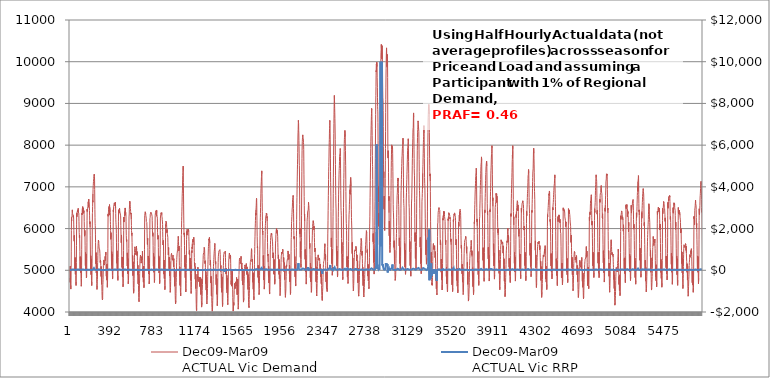
| Category | Dec09-Mar09 
ACTUAL Vic Demand |
|---|---|
| 0 | 4814.35 |
| 1 | 4710.32 |
| 2 | 5098.12 |
| 3 | 4940.95 |
| 4 | 4762.79 |
| 5 | 4645.21 |
| 6 | 4589.7 |
| 7 | 4549.49 |
| 8 | 4639.4 |
| 9 | 4763.9 |
| 10 | 5061.87 |
| 11 | 5441.15 |
| 12 | 5955.85 |
| 13 | 6263.2 |
| 14 | 6181.63 |
| 15 | 6211.84 |
| 16 | 6288.14 |
| 17 | 6304.76 |
| 18 | 6316.41 |
| 19 | 6357.25 |
| 20 | 6377.54 |
| 21 | 6448.24 |
| 22 | 6392.62 |
| 23 | 6365.6 |
| 24 | 6381.2 |
| 25 | 6384.16 |
| 26 | 6363.31 |
| 27 | 6349.62 |
| 28 | 6314.06 |
| 29 | 6272.93 |
| 30 | 6309.29 |
| 31 | 6285.74 |
| 32 | 6284.96 |
| 33 | 6227.77 |
| 34 | 6087.37 |
| 35 | 5954.17 |
| 36 | 5825.45 |
| 37 | 5727.82 |
| 38 | 5696.84 |
| 39 | 5834.98 |
| 40 | 5820.08 |
| 41 | 5715.86 |
| 42 | 5485.47 |
| 43 | 5251.98 |
| 44 | 5056.97 |
| 45 | 4997.56 |
| 46 | 5305.11 |
| 47 | 5207.66 |
| 48 | 5036.46 |
| 49 | 4904.88 |
| 50 | 5282.32 |
| 51 | 5096.13 |
| 52 | 4877.05 |
| 53 | 4733.01 |
| 54 | 4663.76 |
| 55 | 4635.86 |
| 56 | 4730.65 |
| 57 | 4887.14 |
| 58 | 5185.77 |
| 59 | 5589.48 |
| 60 | 6088.36 |
| 61 | 6364.4 |
| 62 | 6282.86 |
| 63 | 6272.21 |
| 64 | 6260.13 |
| 65 | 6387.47 |
| 66 | 6364.16 |
| 67 | 6392.78 |
| 68 | 6405.42 |
| 69 | 6444.52 |
| 70 | 6425.91 |
| 71 | 6400.38 |
| 72 | 6445.79 |
| 73 | 6466.79 |
| 74 | 6453.61 |
| 75 | 6484.99 |
| 76 | 6397.29 |
| 77 | 6388.47 |
| 78 | 6392.6 |
| 79 | 6378.63 |
| 80 | 6372.11 |
| 81 | 6308.11 |
| 82 | 6169.96 |
| 83 | 6034 |
| 84 | 5904.5 |
| 85 | 5848.97 |
| 86 | 5783.79 |
| 87 | 5846.23 |
| 88 | 5784.95 |
| 89 | 5629.75 |
| 90 | 5446.45 |
| 91 | 5207.61 |
| 92 | 5050.97 |
| 93 | 4984.23 |
| 94 | 5325.82 |
| 95 | 5215.83 |
| 96 | 5056.65 |
| 97 | 4941.71 |
| 98 | 5304.39 |
| 99 | 5139.94 |
| 100 | 4947.89 |
| 101 | 4793.39 |
| 102 | 4715.62 |
| 103 | 4617.69 |
| 104 | 4652.72 |
| 105 | 4797.32 |
| 106 | 5105.48 |
| 107 | 5492.14 |
| 108 | 6006.16 |
| 109 | 6370.73 |
| 110 | 6330.28 |
| 111 | 6365.26 |
| 112 | 6462.01 |
| 113 | 6479.34 |
| 114 | 6492.89 |
| 115 | 6496.65 |
| 116 | 6527.3 |
| 117 | 6359.29 |
| 118 | 6465.3 |
| 119 | 6500.31 |
| 120 | 6515.9 |
| 121 | 6523.16 |
| 122 | 6482.18 |
| 123 | 6463.06 |
| 124 | 6411.79 |
| 125 | 6380.66 |
| 126 | 6430.92 |
| 127 | 6437.86 |
| 128 | 6400.92 |
| 129 | 6342.7 |
| 130 | 6168.56 |
| 131 | 6029.29 |
| 132 | 5864.65 |
| 133 | 5817.97 |
| 134 | 5816.4 |
| 135 | 5932.37 |
| 136 | 5957.41 |
| 137 | 5832.9 |
| 138 | 5600.41 |
| 139 | 5364.73 |
| 140 | 5209.08 |
| 141 | 5110.8 |
| 142 | 5423.77 |
| 143 | 5333.66 |
| 144 | 5148.89 |
| 145 | 5027.66 |
| 146 | 5391.9 |
| 147 | 5224.96 |
| 148 | 5032.7 |
| 149 | 4903.03 |
| 150 | 4821.34 |
| 151 | 4801.47 |
| 152 | 4851.14 |
| 153 | 4959.57 |
| 154 | 5275.21 |
| 155 | 5673.02 |
| 156 | 6194.74 |
| 157 | 6468.1 |
| 158 | 6410.53 |
| 159 | 6389.02 |
| 160 | 6460.63 |
| 161 | 6451.72 |
| 162 | 6489.76 |
| 163 | 6529.12 |
| 164 | 6548.01 |
| 165 | 6568.19 |
| 166 | 6591.79 |
| 167 | 6642.13 |
| 168 | 6628.6 |
| 169 | 6641.67 |
| 170 | 6512.48 |
| 171 | 6705.2 |
| 172 | 6673.92 |
| 173 | 6640.47 |
| 174 | 6635.26 |
| 175 | 6612.96 |
| 176 | 6601.62 |
| 177 | 6536.39 |
| 178 | 6436.74 |
| 179 | 6322.17 |
| 180 | 6202.15 |
| 181 | 6109.82 |
| 182 | 6107.53 |
| 183 | 6164.76 |
| 184 | 6031.19 |
| 185 | 5827.35 |
| 186 | 5581.28 |
| 187 | 5312.82 |
| 188 | 5125.44 |
| 189 | 5021.24 |
| 190 | 5347.15 |
| 191 | 5224.52 |
| 192 | 5025.02 |
| 193 | 4894.96 |
| 194 | 5272.99 |
| 195 | 5103.4 |
| 196 | 4897.89 |
| 197 | 4749.76 |
| 198 | 4670.82 |
| 199 | 4633.57 |
| 200 | 4716.62 |
| 201 | 4880.95 |
| 202 | 5154.67 |
| 203 | 5505.61 |
| 204 | 6001.99 |
| 205 | 6355.34 |
| 206 | 6384.98 |
| 207 | 6529.24 |
| 208 | 6671.86 |
| 209 | 6632.73 |
| 210 | 6829.82 |
| 211 | 6935.03 |
| 212 | 6997.17 |
| 213 | 7034.96 |
| 214 | 7090.21 |
| 215 | 7129.36 |
| 216 | 7166.03 |
| 217 | 7197.02 |
| 218 | 7253.14 |
| 219 | 7251.51 |
| 220 | 7252.4 |
| 221 | 7231.69 |
| 222 | 7303.76 |
| 223 | 7312.39 |
| 224 | 7247.45 |
| 225 | 7162.72 |
| 226 | 6931.52 |
| 227 | 6683.84 |
| 228 | 6455.75 |
| 229 | 6264.68 |
| 230 | 6116.34 |
| 231 | 6075.03 |
| 232 | 5998.35 |
| 233 | 5848.6 |
| 234 | 5664.72 |
| 235 | 5437.03 |
| 236 | 5254.86 |
| 237 | 5155.67 |
| 238 | 5423.73 |
| 239 | 5275.12 |
| 240 | 5052.86 |
| 241 | 4933.85 |
| 242 | 5273.05 |
| 243 | 5069.58 |
| 244 | 4846.01 |
| 245 | 4681.74 |
| 246 | 4587.22 |
| 247 | 4541.55 |
| 248 | 4564.47 |
| 249 | 4634.42 |
| 250 | 4722.91 |
| 251 | 4779.51 |
| 252 | 4981.23 |
| 253 | 5182.16 |
| 254 | 5226.72 |
| 255 | 5349.91 |
| 256 | 5503.62 |
| 257 | 5594.24 |
| 258 | 5639.57 |
| 259 | 5676.49 |
| 260 | 5722.16 |
| 261 | 5714.31 |
| 262 | 5700.53 |
| 263 | 5695.12 |
| 264 | 5646.18 |
| 265 | 5609.54 |
| 266 | 5576.9 |
| 267 | 5532.32 |
| 268 | 5512.21 |
| 269 | 5532.88 |
| 270 | 5525.39 |
| 271 | 5524.94 |
| 272 | 5488.18 |
| 273 | 5466.92 |
| 274 | 5404.63 |
| 275 | 5322.04 |
| 276 | 5239.26 |
| 277 | 5187.47 |
| 278 | 5166.95 |
| 279 | 5239.06 |
| 280 | 5259.77 |
| 281 | 5208.23 |
| 282 | 5109.81 |
| 283 | 4982.31 |
| 284 | 4879.47 |
| 285 | 4851.21 |
| 286 | 5088.4 |
| 287 | 4959.38 |
| 288 | 4782.27 |
| 289 | 4665.14 |
| 290 | 5007.71 |
| 291 | 4839.23 |
| 292 | 4641.47 |
| 293 | 4494.33 |
| 294 | 4390.76 |
| 295 | 4316.79 |
| 296 | 4330.93 |
| 297 | 4287.88 |
| 298 | 4296.74 |
| 299 | 4322.11 |
| 300 | 4487.83 |
| 301 | 4657.5 |
| 302 | 4702.26 |
| 303 | 4783.48 |
| 304 | 4909.66 |
| 305 | 5011.01 |
| 306 | 5108.95 |
| 307 | 5149 |
| 308 | 5187.28 |
| 309 | 5166.64 |
| 310 | 5210.63 |
| 311 | 5248.14 |
| 312 | 5164.45 |
| 313 | 5123.02 |
| 314 | 5111.61 |
| 315 | 5114.3 |
| 316 | 5109.78 |
| 317 | 5129.75 |
| 318 | 5155.74 |
| 319 | 5225.99 |
| 320 | 5229.72 |
| 321 | 5307.53 |
| 322 | 5332.5 |
| 323 | 5283.66 |
| 324 | 5234.43 |
| 325 | 5221.55 |
| 326 | 5266.6 |
| 327 | 5369.83 |
| 328 | 5438.56 |
| 329 | 5366.29 |
| 330 | 5219.12 |
| 331 | 5053.1 |
| 332 | 4926.51 |
| 333 | 4857.44 |
| 334 | 5115.05 |
| 335 | 4997.75 |
| 336 | 4845.41 |
| 337 | 4763.53 |
| 338 | 5148.07 |
| 339 | 5000.28 |
| 340 | 4824.01 |
| 341 | 4698.6 |
| 342 | 4592.63 |
| 343 | 4586.39 |
| 344 | 4746.96 |
| 345 | 4873.27 |
| 346 | 5177.08 |
| 347 | 5527.6 |
| 348 | 6032.12 |
| 349 | 6350.54 |
| 350 | 6296.13 |
| 351 | 6326.1 |
| 352 | 6382.13 |
| 353 | 6416.71 |
| 354 | 6459.89 |
| 355 | 6501.91 |
| 356 | 6515.47 |
| 357 | 6525.27 |
| 358 | 6530 |
| 359 | 6547.34 |
| 360 | 6534.57 |
| 361 | 6323.4 |
| 362 | 6573.86 |
| 363 | 6529.89 |
| 364 | 6535.68 |
| 365 | 6509.7 |
| 366 | 6522.32 |
| 367 | 6541.28 |
| 368 | 6486.96 |
| 369 | 6379.98 |
| 370 | 6167.31 |
| 371 | 6098.16 |
| 372 | 5951.31 |
| 373 | 5837.09 |
| 374 | 5742.25 |
| 375 | 5861.05 |
| 376 | 5901.97 |
| 377 | 5784.9 |
| 378 | 5602.62 |
| 379 | 5403.14 |
| 380 | 5219.78 |
| 381 | 5120.55 |
| 382 | 5445.21 |
| 383 | 5337.21 |
| 384 | 5152.59 |
| 385 | 5021.41 |
| 386 | 5390.81 |
| 387 | 5202.63 |
| 388 | 5006.45 |
| 389 | 4875.66 |
| 390 | 4790.27 |
| 391 | 4770.34 |
| 392 | 4848.73 |
| 393 | 4998.32 |
| 394 | 5312.92 |
| 395 | 5681.35 |
| 396 | 6136.14 |
| 397 | 6449.7 |
| 398 | 6403.95 |
| 399 | 6422.76 |
| 400 | 6510.91 |
| 401 | 6538.35 |
| 402 | 6549.57 |
| 403 | 6567.68 |
| 404 | 6570.67 |
| 405 | 6614.24 |
| 406 | 6607.03 |
| 407 | 6596.2 |
| 408 | 6613.87 |
| 409 | 6627.6 |
| 410 | 6618.64 |
| 411 | 6586.82 |
| 412 | 6574.32 |
| 413 | 6544.46 |
| 414 | 6593.74 |
| 415 | 6635.14 |
| 416 | 6651.09 |
| 417 | 6645.02 |
| 418 | 6493.57 |
| 419 | 6360.14 |
| 420 | 6211.6 |
| 421 | 6151.07 |
| 422 | 6093.95 |
| 423 | 6115.33 |
| 424 | 6011.76 |
| 425 | 5885.56 |
| 426 | 5673.38 |
| 427 | 5430.02 |
| 428 | 5253.25 |
| 429 | 5168.71 |
| 430 | 5467.38 |
| 431 | 5330.67 |
| 432 | 5159.66 |
| 433 | 5006.03 |
| 434 | 5373.22 |
| 435 | 5192.53 |
| 436 | 4987.28 |
| 437 | 4849.08 |
| 438 | 4782.39 |
| 439 | 4758.24 |
| 440 | 4873.63 |
| 441 | 5031.56 |
| 442 | 5310.3 |
| 443 | 5666.96 |
| 444 | 6162.14 |
| 445 | 6450.42 |
| 446 | 6366.15 |
| 447 | 6373.24 |
| 448 | 6410.42 |
| 449 | 6407.5 |
| 450 | 6379.13 |
| 451 | 6419.77 |
| 452 | 6422.83 |
| 453 | 6411.47 |
| 454 | 6486.74 |
| 455 | 6431.85 |
| 456 | 6440.54 |
| 457 | 6410.63 |
| 458 | 6414.35 |
| 459 | 6376.52 |
| 460 | 6359.19 |
| 461 | 6362.65 |
| 462 | 6353.16 |
| 463 | 6353.9 |
| 464 | 6304.84 |
| 465 | 6227.64 |
| 466 | 6067.95 |
| 467 | 5940.07 |
| 468 | 5800.77 |
| 469 | 5718.91 |
| 470 | 5659.77 |
| 471 | 5766.44 |
| 472 | 5846.94 |
| 473 | 5760.14 |
| 474 | 5581.57 |
| 475 | 5346.63 |
| 476 | 5167.23 |
| 477 | 5067.69 |
| 478 | 5318.81 |
| 479 | 5137.69 |
| 480 | 4951.02 |
| 481 | 4847.53 |
| 482 | 5200.2 |
| 483 | 5051.18 |
| 484 | 4854.31 |
| 485 | 4692.79 |
| 486 | 4603.88 |
| 487 | 4607.42 |
| 488 | 4681.11 |
| 489 | 4796.67 |
| 490 | 5122.85 |
| 491 | 5477.97 |
| 492 | 5955.07 |
| 493 | 6276.98 |
| 494 | 6156.26 |
| 495 | 6165.33 |
| 496 | 6216.27 |
| 497 | 6213.44 |
| 498 | 6229.85 |
| 499 | 6289.94 |
| 500 | 6330.38 |
| 501 | 6350.18 |
| 502 | 6366.1 |
| 503 | 6384.63 |
| 504 | 6409.47 |
| 505 | 6318.27 |
| 506 | 6493.99 |
| 507 | 6480.76 |
| 508 | 6413.67 |
| 509 | 6423.77 |
| 510 | 6426.34 |
| 511 | 6431.01 |
| 512 | 6381.54 |
| 513 | 6330.63 |
| 514 | 6162.8 |
| 515 | 5974.8 |
| 516 | 5832.99 |
| 517 | 5747.21 |
| 518 | 5691.27 |
| 519 | 5738.33 |
| 520 | 5759.94 |
| 521 | 5695.89 |
| 522 | 5508.97 |
| 523 | 5324.23 |
| 524 | 5209.33 |
| 525 | 5102.57 |
| 526 | 5416.61 |
| 527 | 5259.59 |
| 528 | 5062.25 |
| 529 | 4918.25 |
| 530 | 5281.09 |
| 531 | 5098.86 |
| 532 | 4905.38 |
| 533 | 4762.79 |
| 534 | 4675.58 |
| 535 | 4681.38 |
| 536 | 4753.05 |
| 537 | 4866.88 |
| 538 | 5177.85 |
| 539 | 5521.35 |
| 540 | 5947.99 |
| 541 | 6278.57 |
| 542 | 6283.38 |
| 543 | 6349.86 |
| 544 | 6463.3 |
| 545 | 6485.11 |
| 546 | 6565.57 |
| 547 | 6563.77 |
| 548 | 6656.15 |
| 549 | 6650.49 |
| 550 | 6636.26 |
| 551 | 6594.32 |
| 552 | 6571.94 |
| 553 | 6535.74 |
| 554 | 6477.18 |
| 555 | 6474.29 |
| 556 | 6408.21 |
| 557 | 6347.06 |
| 558 | 6346.72 |
| 559 | 6354.26 |
| 560 | 6373.31 |
| 561 | 6365.37 |
| 562 | 6219.29 |
| 563 | 6075.68 |
| 564 | 5955.22 |
| 565 | 5902.36 |
| 566 | 5860.44 |
| 567 | 5896.65 |
| 568 | 5813.77 |
| 569 | 5664.65 |
| 570 | 5485.46 |
| 571 | 5260.08 |
| 572 | 5141.81 |
| 573 | 5066.04 |
| 574 | 5353.38 |
| 575 | 5245.53 |
| 576 | 5013.26 |
| 577 | 4871.89 |
| 578 | 5203.38 |
| 579 | 5015.23 |
| 580 | 4755.11 |
| 581 | 4579.17 |
| 582 | 4503.75 |
| 583 | 4450.83 |
| 584 | 4430.68 |
| 585 | 4456.41 |
| 586 | 4540.55 |
| 587 | 4587.07 |
| 588 | 4812.13 |
| 589 | 5001.12 |
| 590 | 5131.08 |
| 591 | 5296.7 |
| 592 | 5427.15 |
| 593 | 5515.49 |
| 594 | 5561.92 |
| 595 | 5572.58 |
| 596 | 5565.21 |
| 597 | 5535.29 |
| 598 | 5535.48 |
| 599 | 5535.61 |
| 600 | 5477.82 |
| 601 | 5421.08 |
| 602 | 5377.12 |
| 603 | 5391.85 |
| 604 | 5368.1 |
| 605 | 5401.32 |
| 606 | 5405 |
| 607 | 5478.39 |
| 608 | 5524.99 |
| 609 | 5576.93 |
| 610 | 5553.85 |
| 611 | 5490.58 |
| 612 | 5427.31 |
| 613 | 5387.08 |
| 614 | 5355.26 |
| 615 | 5448.18 |
| 616 | 5442.35 |
| 617 | 5371.42 |
| 618 | 5239.39 |
| 619 | 5077.97 |
| 620 | 4966.41 |
| 621 | 4893.19 |
| 622 | 5119.45 |
| 623 | 5002.82 |
| 624 | 4811.4 |
| 625 | 4673.95 |
| 626 | 5023.17 |
| 627 | 4855.6 |
| 628 | 4634.46 |
| 629 | 4473.46 |
| 630 | 4350.79 |
| 631 | 4272.98 |
| 632 | 4249.9 |
| 633 | 4246.49 |
| 634 | 4300.06 |
| 635 | 4339.07 |
| 636 | 4501.22 |
| 637 | 4692.36 |
| 638 | 4766.93 |
| 639 | 4921.81 |
| 640 | 5072.64 |
| 641 | 5167.39 |
| 642 | 5272.25 |
| 643 | 5272.51 |
| 644 | 5275.5 |
| 645 | 5339.06 |
| 646 | 5363.99 |
| 647 | 5332.66 |
| 648 | 5280.4 |
| 649 | 5237.16 |
| 650 | 5236.92 |
| 651 | 5203.16 |
| 652 | 5171.36 |
| 653 | 5189.87 |
| 654 | 5180.22 |
| 655 | 5203.2 |
| 656 | 5276.93 |
| 657 | 5326.28 |
| 658 | 5337.3 |
| 659 | 5286.89 |
| 660 | 5244.24 |
| 661 | 5224.55 |
| 662 | 5238.64 |
| 663 | 5329.77 |
| 664 | 5458.09 |
| 665 | 5409.34 |
| 666 | 5242.97 |
| 667 | 5073.65 |
| 668 | 4919.28 |
| 669 | 4831.09 |
| 670 | 5062.7 |
| 671 | 4957.18 |
| 672 | 4806.82 |
| 673 | 4714.77 |
| 674 | 5102.31 |
| 675 | 4966.27 |
| 676 | 4770.72 |
| 677 | 4647.5 |
| 678 | 4581.76 |
| 679 | 4584.07 |
| 680 | 4661.75 |
| 681 | 4805.98 |
| 682 | 5114.49 |
| 683 | 5493.16 |
| 684 | 5975.9 |
| 685 | 6309.22 |
| 686 | 6307.54 |
| 687 | 6325.01 |
| 688 | 6372.18 |
| 689 | 6388.45 |
| 690 | 6402.47 |
| 691 | 6407.08 |
| 692 | 6394.16 |
| 693 | 6383.74 |
| 694 | 6352.77 |
| 695 | 6319.68 |
| 696 | 6317.24 |
| 697 | 6317.69 |
| 698 | 6323.09 |
| 699 | 6247.92 |
| 700 | 6171.34 |
| 701 | 6148.42 |
| 702 | 6187.57 |
| 703 | 6171.49 |
| 704 | 6146.44 |
| 705 | 6146.55 |
| 706 | 6010.08 |
| 707 | 5890.57 |
| 708 | 5746.52 |
| 709 | 5656.24 |
| 710 | 5618.16 |
| 711 | 5711.76 |
| 712 | 5772.81 |
| 713 | 5717.81 |
| 714 | 5545.2 |
| 715 | 5302.17 |
| 716 | 5131.07 |
| 717 | 5021.45 |
| 718 | 5343.02 |
| 719 | 5208.38 |
| 720 | 5030.25 |
| 721 | 4912.08 |
| 722 | 5291.69 |
| 723 | 5116.34 |
| 724 | 4911.72 |
| 725 | 4752.91 |
| 726 | 4673.36 |
| 727 | 4656.28 |
| 728 | 4738.46 |
| 729 | 4878.39 |
| 730 | 5161.46 |
| 731 | 5500.82 |
| 732 | 5960.68 |
| 733 | 6237.32 |
| 734 | 6218.78 |
| 735 | 6267.94 |
| 736 | 6345.87 |
| 737 | 6327.17 |
| 738 | 6331.28 |
| 739 | 6370.45 |
| 740 | 6378.13 |
| 741 | 6395.24 |
| 742 | 6387.36 |
| 743 | 6387.33 |
| 744 | 6406.61 |
| 745 | 6415.26 |
| 746 | 6398.8 |
| 747 | 6370.97 |
| 748 | 6350.06 |
| 749 | 6352.03 |
| 750 | 6371.03 |
| 751 | 6381.84 |
| 752 | 6360.48 |
| 753 | 6292.1 |
| 754 | 6187.61 |
| 755 | 6085.52 |
| 756 | 5943.76 |
| 757 | 5887.6 |
| 758 | 5831.26 |
| 759 | 5874.51 |
| 760 | 5900.87 |
| 761 | 5801.92 |
| 762 | 5597 |
| 763 | 5374.07 |
| 764 | 5194.74 |
| 765 | 5097.45 |
| 766 | 5402.24 |
| 767 | 5287.96 |
| 768 | 5094.42 |
| 769 | 4952.2 |
| 770 | 5324.54 |
| 771 | 5128.61 |
| 772 | 4921.82 |
| 773 | 4776.06 |
| 774 | 4707.59 |
| 775 | 4699.84 |
| 776 | 4788.71 |
| 777 | 4947.76 |
| 778 | 5259.87 |
| 779 | 5567.22 |
| 780 | 6020.69 |
| 781 | 6312.47 |
| 782 | 6301.58 |
| 783 | 6309.8 |
| 784 | 6391.92 |
| 785 | 6398.13 |
| 786 | 6398.5 |
| 787 | 6399.6 |
| 788 | 6412.59 |
| 789 | 6428.81 |
| 790 | 6430.9 |
| 791 | 6396.38 |
| 792 | 6387.26 |
| 793 | 6296.79 |
| 794 | 6445.52 |
| 795 | 6423.64 |
| 796 | 6387.36 |
| 797 | 6331.76 |
| 798 | 6311.04 |
| 799 | 6293.07 |
| 800 | 6286.38 |
| 801 | 6249.47 |
| 802 | 6065.26 |
| 803 | 5912.13 |
| 804 | 5795.73 |
| 805 | 5745.51 |
| 806 | 5729.5 |
| 807 | 5776.99 |
| 808 | 5836.27 |
| 809 | 5737.67 |
| 810 | 5544.61 |
| 811 | 5318.29 |
| 812 | 5187.2 |
| 813 | 5060.9 |
| 814 | 5344.38 |
| 815 | 5237.13 |
| 816 | 5043.39 |
| 817 | 4934.03 |
| 818 | 5303.49 |
| 819 | 5136.64 |
| 820 | 4922.46 |
| 821 | 4752.9 |
| 822 | 4680.95 |
| 823 | 4671.34 |
| 824 | 4764.21 |
| 825 | 4909.6 |
| 826 | 5201.88 |
| 827 | 5504.32 |
| 828 | 5956.04 |
| 829 | 6252.29 |
| 830 | 6239.17 |
| 831 | 6273.89 |
| 832 | 6328.3 |
| 833 | 6323.71 |
| 834 | 6353.5 |
| 835 | 6377.72 |
| 836 | 6374.66 |
| 837 | 6362.21 |
| 838 | 6345.26 |
| 839 | 6341.04 |
| 840 | 6333.72 |
| 841 | 6380.43 |
| 842 | 6333.22 |
| 843 | 6290.94 |
| 844 | 6273.7 |
| 845 | 6255 |
| 846 | 6211.42 |
| 847 | 6226.98 |
| 848 | 6158.65 |
| 849 | 6096.49 |
| 850 | 5935.19 |
| 851 | 5787.4 |
| 852 | 5637.6 |
| 853 | 5606.52 |
| 854 | 5608.67 |
| 855 | 5689.49 |
| 856 | 5716.4 |
| 857 | 5645.96 |
| 858 | 5460.92 |
| 859 | 5205.39 |
| 860 | 5019.73 |
| 861 | 4907.46 |
| 862 | 5245.71 |
| 863 | 5089.58 |
| 864 | 4922.61 |
| 865 | 4803.03 |
| 866 | 5151.1 |
| 867 | 4983.66 |
| 868 | 4778.82 |
| 869 | 4629.13 |
| 870 | 4535.29 |
| 871 | 4524.62 |
| 872 | 4620.11 |
| 873 | 4783.01 |
| 874 | 5059.84 |
| 875 | 5345.34 |
| 876 | 5794.32 |
| 877 | 6086.51 |
| 878 | 6058.69 |
| 879 | 6121.89 |
| 880 | 6175.52 |
| 881 | 6171.29 |
| 882 | 6168.48 |
| 883 | 6164.05 |
| 884 | 6166.47 |
| 885 | 6140.64 |
| 886 | 6088.64 |
| 887 | 6027 |
| 888 | 5978.66 |
| 889 | 5899.41 |
| 890 | 5978.56 |
| 891 | 5911.32 |
| 892 | 5879.15 |
| 893 | 5873.46 |
| 894 | 5850.44 |
| 895 | 5850.65 |
| 896 | 5836.38 |
| 897 | 5788.89 |
| 898 | 5659.53 |
| 899 | 5568.11 |
| 900 | 5460.33 |
| 901 | 5390.5 |
| 902 | 5365.57 |
| 903 | 5446.61 |
| 904 | 5547.5 |
| 905 | 5501.26 |
| 906 | 5386.8 |
| 907 | 5236.36 |
| 908 | 5113.43 |
| 909 | 5035.03 |
| 910 | 5314.55 |
| 911 | 5187.47 |
| 912 | 4992.01 |
| 913 | 4863.62 |
| 914 | 5207.94 |
| 915 | 5036.71 |
| 916 | 4807.71 |
| 917 | 4668.91 |
| 918 | 4527.93 |
| 919 | 4471.9 |
| 920 | 4477.16 |
| 921 | 4513.67 |
| 922 | 4591.38 |
| 923 | 4728.31 |
| 924 | 4966.7 |
| 925 | 5174.67 |
| 926 | 5237.49 |
| 927 | 5305.82 |
| 928 | 5369.57 |
| 929 | 5377.17 |
| 930 | 5392.5 |
| 931 | 5402.95 |
| 932 | 5377.72 |
| 933 | 5388.76 |
| 934 | 5386.36 |
| 935 | 5343.84 |
| 936 | 5307.28 |
| 937 | 5275.62 |
| 938 | 5259.41 |
| 939 | 5254.98 |
| 940 | 5241.96 |
| 941 | 5267.94 |
| 942 | 5295.83 |
| 943 | 5330.71 |
| 944 | 5345.01 |
| 945 | 5360.94 |
| 946 | 5331.21 |
| 947 | 5246.76 |
| 948 | 5181.91 |
| 949 | 5125.18 |
| 950 | 5077.67 |
| 951 | 5121.15 |
| 952 | 5279.53 |
| 953 | 5250.79 |
| 954 | 5147.51 |
| 955 | 5012.95 |
| 956 | 4923.75 |
| 957 | 4833.66 |
| 958 | 5046.78 |
| 959 | 4935.64 |
| 960 | 4759.6 |
| 961 | 4616.24 |
| 962 | 4968.84 |
| 963 | 4801.82 |
| 964 | 4604.24 |
| 965 | 4398.36 |
| 966 | 4300.11 |
| 967 | 4237.21 |
| 968 | 4195.09 |
| 969 | 4187.28 |
| 970 | 4196.39 |
| 971 | 4267.54 |
| 972 | 4440.32 |
| 973 | 4618.45 |
| 974 | 4705.5 |
| 975 | 4826.69 |
| 976 | 4993.22 |
| 977 | 5079.81 |
| 978 | 5191.63 |
| 979 | 5258.17 |
| 980 | 5314.85 |
| 981 | 5321.7 |
| 982 | 5396.19 |
| 983 | 5407.89 |
| 984 | 5436.03 |
| 985 | 5465.64 |
| 986 | 5489.97 |
| 987 | 5514.32 |
| 988 | 5560.64 |
| 989 | 5619.32 |
| 990 | 5671.26 |
| 991 | 5738 |
| 992 | 5768.26 |
| 993 | 5813.23 |
| 994 | 5774.82 |
| 995 | 5691.47 |
| 996 | 5594.65 |
| 997 | 5510.39 |
| 998 | 5462.01 |
| 999 | 5534.76 |
| 1000 | 5582.89 |
| 1001 | 5480.06 |
| 1002 | 5299.01 |
| 1003 | 5113.32 |
| 1004 | 4991.54 |
| 1005 | 4869.02 |
| 1006 | 5079.19 |
| 1007 | 4952.2 |
| 1008 | 4764.85 |
| 1009 | 4637.6 |
| 1010 | 4999.1 |
| 1011 | 4833.78 |
| 1012 | 4584.18 |
| 1013 | 4469.68 |
| 1014 | 4412.96 |
| 1015 | 4385.35 |
| 1016 | 4463.92 |
| 1017 | 4586.84 |
| 1018 | 4864.78 |
| 1019 | 5179.62 |
| 1020 | 5549.63 |
| 1021 | 5827.69 |
| 1022 | 5859.11 |
| 1023 | 6022.54 |
| 1024 | 6197.33 |
| 1025 | 6294.59 |
| 1026 | 6417.15 |
| 1027 | 6532.2 |
| 1028 | 6631.98 |
| 1029 | 6776.2 |
| 1030 | 6848.32 |
| 1031 | 6922.55 |
| 1032 | 7042.47 |
| 1033 | 7167.36 |
| 1034 | 7271.66 |
| 1035 | 7349.29 |
| 1036 | 7395.02 |
| 1037 | 7464.26 |
| 1038 | 7497.1 |
| 1039 | 7384.1 |
| 1040 | 7102.04 |
| 1041 | 6851.03 |
| 1042 | 6567.67 |
| 1043 | 6324.11 |
| 1044 | 6124.03 |
| 1045 | 5963.04 |
| 1046 | 5858.21 |
| 1047 | 5864.71 |
| 1048 | 5895.39 |
| 1049 | 5795.91 |
| 1050 | 5597.05 |
| 1051 | 5380.67 |
| 1052 | 5216.44 |
| 1053 | 5081.99 |
| 1054 | 5367.31 |
| 1055 | 5181.8 |
| 1056 | 4961.56 |
| 1057 | 4821.55 |
| 1058 | 5160.92 |
| 1059 | 4992.97 |
| 1060 | 4762.15 |
| 1061 | 4537.34 |
| 1062 | 4479.77 |
| 1063 | 4501.73 |
| 1064 | 4548.99 |
| 1065 | 4679.82 |
| 1066 | 4946.89 |
| 1067 | 5166.32 |
| 1068 | 5483.2 |
| 1069 | 5734.83 |
| 1070 | 5757.9 |
| 1071 | 5866.76 |
| 1072 | 5932.75 |
| 1073 | 5843.06 |
| 1074 | 5982.75 |
| 1075 | 5990.86 |
| 1076 | 5996.79 |
| 1077 | 5987.22 |
| 1078 | 5998.77 |
| 1079 | 5977.79 |
| 1080 | 5963.21 |
| 1081 | 5955.49 |
| 1082 | 5923.68 |
| 1083 | 5922.36 |
| 1084 | 5916.29 |
| 1085 | 5958.4 |
| 1086 | 5983.73 |
| 1087 | 6003.42 |
| 1088 | 5963.61 |
| 1089 | 5936.51 |
| 1090 | 5815.37 |
| 1091 | 5694.15 |
| 1092 | 5561.72 |
| 1093 | 5468.37 |
| 1094 | 5383.35 |
| 1095 | 5403.41 |
| 1096 | 5485.08 |
| 1097 | 5481.49 |
| 1098 | 5351.94 |
| 1099 | 5202.05 |
| 1100 | 5068.44 |
| 1101 | 4983.62 |
| 1102 | 5292.86 |
| 1103 | 5139.25 |
| 1104 | 4914.15 |
| 1105 | 4762.61 |
| 1106 | 5130.77 |
| 1107 | 4942.54 |
| 1108 | 4726.25 |
| 1109 | 4574.87 |
| 1110 | 4491.81 |
| 1111 | 4444.69 |
| 1112 | 4504.56 |
| 1113 | 4584.38 |
| 1114 | 4734.64 |
| 1115 | 4928.9 |
| 1116 | 5225.15 |
| 1117 | 5457.11 |
| 1118 | 5424.12 |
| 1119 | 5495.48 |
| 1120 | 5553.44 |
| 1121 | 5518.29 |
| 1122 | 5634.51 |
| 1123 | 5673.86 |
| 1124 | 5705.44 |
| 1125 | 5738.93 |
| 1126 | 5751.85 |
| 1127 | 5738.1 |
| 1128 | 5712.57 |
| 1129 | 5731.15 |
| 1130 | 5699.64 |
| 1131 | 5679.3 |
| 1132 | 5686.13 |
| 1133 | 5707.21 |
| 1134 | 5755.27 |
| 1135 | 5792.5 |
| 1136 | 5806.9 |
| 1137 | 5784.35 |
| 1138 | 5606.44 |
| 1139 | 5436.05 |
| 1140 | 5308.23 |
| 1141 | 5206.53 |
| 1142 | 5103.24 |
| 1143 | 5103.98 |
| 1144 | 5173.58 |
| 1145 | 5163.99 |
| 1146 | 5075.88 |
| 1147 | 4946.16 |
| 1148 | 4877.27 |
| 1149 | 4785.07 |
| 1150 | 5082.89 |
| 1151 | 4928.22 |
| 1152 | 4721.67 |
| 1153 | 4564.25 |
| 1154 | 4906.39 |
| 1155 | 4710.48 |
| 1156 | 4489.36 |
| 1157 | 4310.99 |
| 1158 | 4177.8 |
| 1159 | 4069.29 |
| 1160 | 4057.41 |
| 1161 | 4033.99 |
| 1162 | 4083.41 |
| 1163 | 4198.06 |
| 1164 | 4380.78 |
| 1165 | 4543.01 |
| 1166 | 4551.19 |
| 1167 | 4624.08 |
| 1168 | 4720.32 |
| 1169 | 4790.51 |
| 1170 | 4863.81 |
| 1171 | 4928.39 |
| 1172 | 5011.02 |
| 1173 | 5073.08 |
| 1174 | 5055.75 |
| 1175 | 4981.04 |
| 1176 | 4881.21 |
| 1177 | 4801.76 |
| 1178 | 4756.83 |
| 1179 | 4732.65 |
| 1180 | 4740.74 |
| 1181 | 4758.14 |
| 1182 | 4807.12 |
| 1183 | 4835.94 |
| 1184 | 4828.51 |
| 1185 | 4832.75 |
| 1186 | 4795.44 |
| 1187 | 4744.79 |
| 1188 | 4697.79 |
| 1189 | 4645.68 |
| 1190 | 4611.01 |
| 1191 | 4644.48 |
| 1192 | 4793.76 |
| 1193 | 4829.87 |
| 1194 | 4776.26 |
| 1195 | 4681.96 |
| 1196 | 4605.88 |
| 1197 | 4534.42 |
| 1198 | 4822.45 |
| 1199 | 4715.28 |
| 1200 | 4530.34 |
| 1201 | 4417.57 |
| 1202 | 4792.8 |
| 1203 | 4614.62 |
| 1204 | 4424.18 |
| 1205 | 4280.8 |
| 1206 | 4164.18 |
| 1207 | 4117.29 |
| 1208 | 4113.16 |
| 1209 | 4108.45 |
| 1210 | 4134.89 |
| 1211 | 4223.45 |
| 1212 | 4374.32 |
| 1213 | 4514.56 |
| 1214 | 4537.56 |
| 1215 | 4659 |
| 1216 | 4811.88 |
| 1217 | 4934.84 |
| 1218 | 5077.39 |
| 1219 | 5151.88 |
| 1220 | 5198.92 |
| 1221 | 5261.63 |
| 1222 | 5350.69 |
| 1223 | 5387.52 |
| 1224 | 5407.64 |
| 1225 | 5378.64 |
| 1226 | 5392.37 |
| 1227 | 5403.14 |
| 1228 | 5428.78 |
| 1229 | 5465.41 |
| 1230 | 5518.09 |
| 1231 | 5548.55 |
| 1232 | 5567.03 |
| 1233 | 5553.42 |
| 1234 | 5508.46 |
| 1235 | 5462.93 |
| 1236 | 5336.88 |
| 1237 | 5239.48 |
| 1238 | 5160.31 |
| 1239 | 5179.93 |
| 1240 | 5229.09 |
| 1241 | 5180.57 |
| 1242 | 5072.14 |
| 1243 | 4902.58 |
| 1244 | 4801.07 |
| 1245 | 4680.46 |
| 1246 | 4969.27 |
| 1247 | 4838.55 |
| 1248 | 4640.64 |
| 1249 | 4525.25 |
| 1250 | 4875.11 |
| 1251 | 4705.04 |
| 1252 | 4503.02 |
| 1253 | 4360.52 |
| 1254 | 4264.76 |
| 1255 | 4193.06 |
| 1256 | 4194.34 |
| 1257 | 4222.89 |
| 1258 | 4283.05 |
| 1259 | 4295.92 |
| 1260 | 4395.7 |
| 1261 | 4563.23 |
| 1262 | 4671.3 |
| 1263 | 4852.1 |
| 1264 | 5005.88 |
| 1265 | 5132.93 |
| 1266 | 5253.46 |
| 1267 | 5339.09 |
| 1268 | 5414.81 |
| 1269 | 5514.19 |
| 1270 | 5567.64 |
| 1271 | 5607.26 |
| 1272 | 5620.42 |
| 1273 | 5675.25 |
| 1274 | 5747.17 |
| 1275 | 5736.51 |
| 1276 | 5719.52 |
| 1277 | 5754.66 |
| 1278 | 5729.61 |
| 1279 | 5786.55 |
| 1280 | 5766.28 |
| 1281 | 5765.48 |
| 1282 | 5657.16 |
| 1283 | 5513.73 |
| 1284 | 5386.42 |
| 1285 | 5209.04 |
| 1286 | 5124.31 |
| 1287 | 5151.4 |
| 1288 | 5237.95 |
| 1289 | 5192.49 |
| 1290 | 5071.4 |
| 1291 | 4956.63 |
| 1292 | 4797.51 |
| 1293 | 4695.83 |
| 1294 | 4853.1 |
| 1295 | 4686.04 |
| 1296 | 4501.82 |
| 1297 | 4386.27 |
| 1298 | 4734.29 |
| 1299 | 4560.53 |
| 1300 | 4351.93 |
| 1301 | 4206.31 |
| 1302 | 4110 |
| 1303 | 4045.38 |
| 1304 | 4026.83 |
| 1305 | 4018.99 |
| 1306 | 4004.05 |
| 1307 | 4048.61 |
| 1308 | 4168.45 |
| 1309 | 4279.63 |
| 1310 | 4341.57 |
| 1311 | 4477.56 |
| 1312 | 4604.14 |
| 1313 | 4775 |
| 1314 | 4955 |
| 1315 | 5013.31 |
| 1316 | 5097.21 |
| 1317 | 5162.77 |
| 1318 | 5201.99 |
| 1319 | 5258.31 |
| 1320 | 5314.86 |
| 1321 | 5334.39 |
| 1322 | 5410.58 |
| 1323 | 5456.65 |
| 1324 | 5478.94 |
| 1325 | 5508 |
| 1326 | 5550.69 |
| 1327 | 5611.33 |
| 1328 | 5643.52 |
| 1329 | 5659.05 |
| 1330 | 5614.93 |
| 1331 | 5506.14 |
| 1332 | 5340.93 |
| 1333 | 5224.95 |
| 1334 | 5146.92 |
| 1335 | 5175.89 |
| 1336 | 5211.39 |
| 1337 | 5152.65 |
| 1338 | 5010.74 |
| 1339 | 4850.61 |
| 1340 | 4740.86 |
| 1341 | 4654.05 |
| 1342 | 4895.26 |
| 1343 | 4738.92 |
| 1344 | 4537.24 |
| 1345 | 4426.03 |
| 1346 | 4799.44 |
| 1347 | 4612.48 |
| 1348 | 4405.37 |
| 1349 | 4285.91 |
| 1350 | 4189.68 |
| 1351 | 4150.72 |
| 1352 | 4204.27 |
| 1353 | 4268.28 |
| 1354 | 4405.01 |
| 1355 | 4574.72 |
| 1356 | 4821.21 |
| 1357 | 5013.44 |
| 1358 | 5044.1 |
| 1359 | 5184.45 |
| 1360 | 5292.89 |
| 1361 | 5336.17 |
| 1362 | 5368.05 |
| 1363 | 5387.09 |
| 1364 | 5424.68 |
| 1365 | 5407.68 |
| 1366 | 5461.11 |
| 1367 | 5456.83 |
| 1368 | 5478.65 |
| 1369 | 5478.38 |
| 1370 | 5461.01 |
| 1371 | 5458.64 |
| 1372 | 5452.2 |
| 1373 | 5445.76 |
| 1374 | 5468.83 |
| 1375 | 5495.9 |
| 1376 | 5512.43 |
| 1377 | 5501.03 |
| 1378 | 5375.7 |
| 1379 | 5228.63 |
| 1380 | 5111.24 |
| 1381 | 5011 |
| 1382 | 4973.24 |
| 1383 | 5042.04 |
| 1384 | 5117.71 |
| 1385 | 5067.22 |
| 1386 | 4927.88 |
| 1387 | 4780.14 |
| 1388 | 4661.76 |
| 1389 | 4574.99 |
| 1390 | 4904.95 |
| 1391 | 4789.36 |
| 1392 | 4597.45 |
| 1393 | 4471.71 |
| 1394 | 4841.65 |
| 1395 | 4675.33 |
| 1396 | 4452.4 |
| 1397 | 4291 |
| 1398 | 4202.41 |
| 1399 | 4131.22 |
| 1400 | 4143.96 |
| 1401 | 4219.72 |
| 1402 | 4342.88 |
| 1403 | 4495.23 |
| 1404 | 4768.74 |
| 1405 | 4986.54 |
| 1406 | 4987.91 |
| 1407 | 5116.36 |
| 1408 | 5220.74 |
| 1409 | 5308.42 |
| 1410 | 5371.81 |
| 1411 | 5388.45 |
| 1412 | 5400.38 |
| 1413 | 5427.75 |
| 1414 | 5442.33 |
| 1415 | 5425.06 |
| 1416 | 5438.9 |
| 1417 | 5435.68 |
| 1418 | 5413.9 |
| 1419 | 5429.42 |
| 1420 | 5424.56 |
| 1421 | 5402.78 |
| 1422 | 5420.35 |
| 1423 | 5419.14 |
| 1424 | 5458.28 |
| 1425 | 5429.62 |
| 1426 | 5301.95 |
| 1427 | 5181.57 |
| 1428 | 5059.87 |
| 1429 | 4956.83 |
| 1430 | 4915.23 |
| 1431 | 4955.13 |
| 1432 | 5051.32 |
| 1433 | 5038.41 |
| 1434 | 4897.04 |
| 1435 | 4721.27 |
| 1436 | 4623.51 |
| 1437 | 4547 |
| 1438 | 4877.98 |
| 1439 | 4757.47 |
| 1440 | 4571.28 |
| 1441 | 4458.53 |
| 1442 | 4814.71 |
| 1443 | 4653.12 |
| 1444 | 4455.53 |
| 1445 | 4325.01 |
| 1446 | 4219.88 |
| 1447 | 4174.02 |
| 1448 | 4212.55 |
| 1449 | 4254.83 |
| 1450 | 4401.72 |
| 1451 | 4527.28 |
| 1452 | 4790.83 |
| 1453 | 4977.91 |
| 1454 | 4970.62 |
| 1455 | 5081.06 |
| 1456 | 5196.01 |
| 1457 | 5281.74 |
| 1458 | 5315.51 |
| 1459 | 5313.57 |
| 1460 | 5378.49 |
| 1461 | 5401.96 |
| 1462 | 5411.82 |
| 1463 | 5397.46 |
| 1464 | 5378.17 |
| 1465 | 5350.16 |
| 1466 | 5314 |
| 1467 | 5281.44 |
| 1468 | 5271.08 |
| 1469 | 5289.94 |
| 1470 | 5320.58 |
| 1471 | 5362.95 |
| 1472 | 5373.68 |
| 1473 | 5329.74 |
| 1474 | 5168.56 |
| 1475 | 5010.03 |
| 1476 | 4873.77 |
| 1477 | 4766.46 |
| 1478 | 4660.74 |
| 1479 | 4650.7 |
| 1480 | 4752.42 |
| 1481 | 4759.91 |
| 1482 | 4686.74 |
| 1483 | 4619.52 |
| 1484 | 4610.99 |
| 1485 | 4638.38 |
| 1486 | 5009.84 |
| 1487 | 4965.47 |
| 1488 | 4799.87 |
| 1489 | 4646.21 |
| 1490 | 4950.16 |
| 1491 | 4755.46 |
| 1492 | 4545.67 |
| 1493 | 4344.02 |
| 1494 | 4193.49 |
| 1495 | 4091.29 |
| 1496 | 4062.91 |
| 1497 | 4021.12 |
| 1498 | 4014.03 |
| 1499 | 4033.43 |
| 1500 | 4138.82 |
| 1501 | 4218.4 |
| 1502 | 4159.86 |
| 1503 | 4239.08 |
| 1504 | 4305.49 |
| 1505 | 4410.89 |
| 1506 | 4510.2 |
| 1507 | 4548.07 |
| 1508 | 4578.3 |
| 1509 | 4637.86 |
| 1510 | 4684.6 |
| 1511 | 4652.27 |
| 1512 | 4608.75 |
| 1513 | 4588.08 |
| 1514 | 4559.5 |
| 1515 | 4546.08 |
| 1516 | 4547.51 |
| 1517 | 4574.81 |
| 1518 | 4615.78 |
| 1519 | 4658.68 |
| 1520 | 4723.2 |
| 1521 | 4727.09 |
| 1522 | 4726.05 |
| 1523 | 4718.51 |
| 1524 | 4676.96 |
| 1525 | 4623.39 |
| 1526 | 4606.23 |
| 1527 | 4698.32 |
| 1528 | 4828.65 |
| 1529 | 4825.57 |
| 1530 | 4702.29 |
| 1531 | 4551.8 |
| 1532 | 4471.27 |
| 1533 | 4414.34 |
| 1534 | 4755.9 |
| 1535 | 4687.9 |
| 1536 | 4519.56 |
| 1537 | 4414.46 |
| 1538 | 4787.84 |
| 1539 | 4609.82 |
| 1540 | 4395.7 |
| 1541 | 4226.47 |
| 1542 | 4133.41 |
| 1543 | 4068.69 |
| 1544 | 4105.27 |
| 1545 | 4152.04 |
| 1546 | 4235.98 |
| 1547 | 4417.84 |
| 1548 | 4667.31 |
| 1549 | 4869.07 |
| 1550 | 4901.61 |
| 1551 | 5014.54 |
| 1552 | 5122.61 |
| 1553 | 5213.15 |
| 1554 | 5256.66 |
| 1555 | 5268.6 |
| 1556 | 5286.68 |
| 1557 | 5282.15 |
| 1558 | 5287.71 |
| 1559 | 5262.49 |
| 1560 | 5240.62 |
| 1561 | 5211.32 |
| 1562 | 5216.68 |
| 1563 | 5162.49 |
| 1564 | 5172.7 |
| 1565 | 5187.15 |
| 1566 | 5191.16 |
| 1567 | 5243.51 |
| 1568 | 5247.1 |
| 1569 | 5334.75 |
| 1570 | 5273.02 |
| 1571 | 5197.34 |
| 1572 | 5108.71 |
| 1573 | 5055.56 |
| 1574 | 4996.25 |
| 1575 | 5059.43 |
| 1576 | 5176.09 |
| 1577 | 5141.52 |
| 1578 | 5051.76 |
| 1579 | 4915.55 |
| 1580 | 4798.6 |
| 1581 | 4743.99 |
| 1582 | 5041.8 |
| 1583 | 4952.66 |
| 1584 | 4772.39 |
| 1585 | 4648.13 |
| 1586 | 5000.92 |
| 1587 | 4815.43 |
| 1588 | 4617.91 |
| 1589 | 4430.04 |
| 1590 | 4313.48 |
| 1591 | 4237.37 |
| 1592 | 4240.92 |
| 1593 | 4245.57 |
| 1594 | 4250.57 |
| 1595 | 4326.87 |
| 1596 | 4512.91 |
| 1597 | 4688.69 |
| 1598 | 4744.34 |
| 1599 | 4847.6 |
| 1600 | 4981.09 |
| 1601 | 5046.32 |
| 1602 | 5090.74 |
| 1603 | 5106.36 |
| 1604 | 5127.86 |
| 1605 | 5146.14 |
| 1606 | 5150.37 |
| 1607 | 5122.2 |
| 1608 | 5090.18 |
| 1609 | 5081.92 |
| 1610 | 5061.16 |
| 1611 | 5047.88 |
| 1612 | 5024.73 |
| 1613 | 4982.2 |
| 1614 | 5054.98 |
| 1615 | 5135.48 |
| 1616 | 5133.71 |
| 1617 | 5161.22 |
| 1618 | 5152.93 |
| 1619 | 5098.47 |
| 1620 | 5017.12 |
| 1621 | 4925.09 |
| 1622 | 4898.95 |
| 1623 | 4952.76 |
| 1624 | 5082.27 |
| 1625 | 5080.96 |
| 1626 | 5005.62 |
| 1627 | 4891.51 |
| 1628 | 4798.71 |
| 1629 | 4711.54 |
| 1630 | 4951.18 |
| 1631 | 4825.58 |
| 1632 | 4652.51 |
| 1633 | 4541.19 |
| 1634 | 4894.53 |
| 1635 | 4704.12 |
| 1636 | 4507.56 |
| 1637 | 4367.14 |
| 1638 | 4232.8 |
| 1639 | 4143.58 |
| 1640 | 4125.66 |
| 1641 | 4122.22 |
| 1642 | 4103.67 |
| 1643 | 4145.31 |
| 1644 | 4299.54 |
| 1645 | 4452.01 |
| 1646 | 4506.66 |
| 1647 | 4607.45 |
| 1648 | 4744.56 |
| 1649 | 4843.25 |
| 1650 | 4959.75 |
| 1651 | 5011.7 |
| 1652 | 5081.73 |
| 1653 | 5115.5 |
| 1654 | 5181.84 |
| 1655 | 5209.01 |
| 1656 | 5216.56 |
| 1657 | 5227.37 |
| 1658 | 5254.21 |
| 1659 | 5253.1 |
| 1660 | 5282.54 |
| 1661 | 5307.29 |
| 1662 | 5365.72 |
| 1663 | 5443.89 |
| 1664 | 5463.09 |
| 1665 | 5516.74 |
| 1666 | 5511.4 |
| 1667 | 5450.23 |
| 1668 | 5372.04 |
| 1669 | 5281.04 |
| 1670 | 5206 |
| 1671 | 5184.13 |
| 1672 | 5271.17 |
| 1673 | 5245.8 |
| 1674 | 5104.66 |
| 1675 | 4936.57 |
| 1676 | 4819.07 |
| 1677 | 4712.91 |
| 1678 | 4944.44 |
| 1679 | 4824.07 |
| 1680 | 4642.39 |
| 1681 | 4546.45 |
| 1682 | 4916.94 |
| 1683 | 4742.53 |
| 1684 | 4554.07 |
| 1685 | 4400.35 |
| 1686 | 4326.43 |
| 1687 | 4291.94 |
| 1688 | 4373.89 |
| 1689 | 4467.32 |
| 1690 | 4623.24 |
| 1691 | 4817.75 |
| 1692 | 5144.3 |
| 1693 | 5369.3 |
| 1694 | 5400.95 |
| 1695 | 5571.94 |
| 1696 | 5728.24 |
| 1697 | 5802.82 |
| 1698 | 5944.2 |
| 1699 | 6021.37 |
| 1700 | 6113.44 |
| 1701 | 6195.66 |
| 1702 | 6282.06 |
| 1703 | 6329.8 |
| 1704 | 6372.2 |
| 1705 | 6323.55 |
| 1706 | 6446.44 |
| 1707 | 6508.18 |
| 1708 | 6547.99 |
| 1709 | 6618.43 |
| 1710 | 6696.75 |
| 1711 | 6723.41 |
| 1712 | 6697.98 |
| 1713 | 6594.61 |
| 1714 | 6386.29 |
| 1715 | 6201.89 |
| 1716 | 5988.42 |
| 1717 | 5812.65 |
| 1718 | 5675.63 |
| 1719 | 5536.68 |
| 1720 | 5576.37 |
| 1721 | 5532.01 |
| 1722 | 5345.42 |
| 1723 | 5099.8 |
| 1724 | 4938.9 |
| 1725 | 4828.75 |
| 1726 | 5116.71 |
| 1727 | 4929.57 |
| 1728 | 4817.23 |
| 1729 | 4705.22 |
| 1730 | 5080.65 |
| 1731 | 4888.47 |
| 1732 | 4695.69 |
| 1733 | 4538.32 |
| 1734 | 4417 |
| 1735 | 4406.21 |
| 1736 | 4466.43 |
| 1737 | 4561.37 |
| 1738 | 4721.69 |
| 1739 | 4879.7 |
| 1740 | 5198.79 |
| 1741 | 5505.79 |
| 1742 | 5605.02 |
| 1743 | 5842.35 |
| 1744 | 5986.16 |
| 1745 | 6173.25 |
| 1746 | 6257.95 |
| 1747 | 6364.41 |
| 1748 | 6507.75 |
| 1749 | 6635.47 |
| 1750 | 6711.97 |
| 1751 | 6849.42 |
| 1752 | 6960.43 |
| 1753 | 7025.85 |
| 1754 | 7049.08 |
| 1755 | 7133.73 |
| 1756 | 7216.61 |
| 1757 | 7248.44 |
| 1758 | 7330.07 |
| 1759 | 7383.35 |
| 1760 | 7313.85 |
| 1761 | 7092.33 |
| 1762 | 6834.56 |
| 1763 | 6631.95 |
| 1764 | 6413.57 |
| 1765 | 6194 |
| 1766 | 6057.73 |
| 1767 | 5914.13 |
| 1768 | 5940.81 |
| 1769 | 5844.94 |
| 1770 | 5581.22 |
| 1771 | 5369.13 |
| 1772 | 5191.64 |
| 1773 | 5091.16 |
| 1774 | 5352.32 |
| 1775 | 5189.08 |
| 1776 | 4930.21 |
| 1777 | 4771.97 |
| 1778 | 5099.46 |
| 1779 | 4909.34 |
| 1780 | 4740.02 |
| 1781 | 4631.96 |
| 1782 | 4548.53 |
| 1783 | 4532.07 |
| 1784 | 4563.78 |
| 1785 | 4685.32 |
| 1786 | 4827.25 |
| 1787 | 5034.53 |
| 1788 | 5381.03 |
| 1789 | 5677.22 |
| 1790 | 5763.65 |
| 1791 | 5933.39 |
| 1792 | 6076.15 |
| 1793 | 6115.03 |
| 1794 | 6200.69 |
| 1795 | 6212.94 |
| 1796 | 6296.7 |
| 1797 | 6278.84 |
| 1798 | 6310.33 |
| 1799 | 6311.68 |
| 1800 | 6324.66 |
| 1801 | 6365.78 |
| 1802 | 6360.68 |
| 1803 | 6329.35 |
| 1804 | 6358.46 |
| 1805 | 6308.21 |
| 1806 | 6282.08 |
| 1807 | 6257.24 |
| 1808 | 6289.09 |
| 1809 | 6175.68 |
| 1810 | 5992.33 |
| 1811 | 5857.21 |
| 1812 | 5663.32 |
| 1813 | 5493.01 |
| 1814 | 5349.02 |
| 1815 | 5350.27 |
| 1816 | 5390.2 |
| 1817 | 5367.1 |
| 1818 | 5191.75 |
| 1819 | 5038.4 |
| 1820 | 4907.39 |
| 1821 | 4833.26 |
| 1822 | 5093.34 |
| 1823 | 4994.31 |
| 1824 | 4810.14 |
| 1825 | 4696.19 |
| 1826 | 5014.54 |
| 1827 | 4846.05 |
| 1828 | 4652.56 |
| 1829 | 4499.06 |
| 1830 | 4461.91 |
| 1831 | 4430.72 |
| 1832 | 4479.99 |
| 1833 | 4545.9 |
| 1834 | 4740.09 |
| 1835 | 4946.19 |
| 1836 | 5200.53 |
| 1837 | 5488.14 |
| 1838 | 5535.74 |
| 1839 | 5623.19 |
| 1840 | 5714.83 |
| 1841 | 5782.36 |
| 1842 | 5820.79 |
| 1843 | 5805.47 |
| 1844 | 5851.17 |
| 1845 | 5849.48 |
| 1846 | 5881.14 |
| 1847 | 5878.44 |
| 1848 | 5855.72 |
| 1849 | 5887.82 |
| 1850 | 5890.19 |
| 1851 | 5843.55 |
| 1852 | 5849.17 |
| 1853 | 5837.93 |
| 1854 | 5844.87 |
| 1855 | 5851.03 |
| 1856 | 5841.27 |
| 1857 | 5840.15 |
| 1858 | 5682.15 |
| 1859 | 5573.24 |
| 1860 | 5457.75 |
| 1861 | 5387.95 |
| 1862 | 5294.27 |
| 1863 | 5375.11 |
| 1864 | 5419.3 |
| 1865 | 5372.38 |
| 1866 | 5235.29 |
| 1867 | 5052.44 |
| 1868 | 4952.28 |
| 1869 | 4917.6 |
| 1870 | 5237 |
| 1871 | 5147.25 |
| 1872 | 4992.43 |
| 1873 | 4899.31 |
| 1874 | 5254.24 |
| 1875 | 5077.92 |
| 1876 | 4877.71 |
| 1877 | 4744.65 |
| 1878 | 4666.15 |
| 1879 | 4642.27 |
| 1880 | 4670.55 |
| 1881 | 4788.65 |
| 1882 | 4975.06 |
| 1883 | 5174.58 |
| 1884 | 5385.78 |
| 1885 | 5632.02 |
| 1886 | 5612.99 |
| 1887 | 5706.7 |
| 1888 | 5772.27 |
| 1889 | 5861.12 |
| 1890 | 5861.65 |
| 1891 | 5943.15 |
| 1892 | 5967.24 |
| 1893 | 5987.16 |
| 1894 | 5990.07 |
| 1895 | 6001.01 |
| 1896 | 6013.9 |
| 1897 | 6016.31 |
| 1898 | 5898.05 |
| 1899 | 5959.55 |
| 1900 | 5944.55 |
| 1901 | 5885.72 |
| 1902 | 5913.69 |
| 1903 | 5899.29 |
| 1904 | 5848.83 |
| 1905 | 5814.14 |
| 1906 | 5666.83 |
| 1907 | 5551.23 |
| 1908 | 5414.69 |
| 1909 | 5342.24 |
| 1910 | 5282.16 |
| 1911 | 5313.36 |
| 1912 | 5368.17 |
| 1913 | 5293.73 |
| 1914 | 5166.92 |
| 1915 | 5041.89 |
| 1916 | 4984.21 |
| 1917 | 4901.14 |
| 1918 | 5257.89 |
| 1919 | 5140.18 |
| 1920 | 4958.28 |
| 1921 | 4794.41 |
| 1922 | 5149.15 |
| 1923 | 4970.86 |
| 1924 | 4742.29 |
| 1925 | 4575.21 |
| 1926 | 4477.38 |
| 1927 | 4393.91 |
| 1928 | 4420.06 |
| 1929 | 4440.85 |
| 1930 | 4504.39 |
| 1931 | 4581.29 |
| 1932 | 4739.87 |
| 1933 | 4893.09 |
| 1934 | 4918.8 |
| 1935 | 4984.61 |
| 1936 | 5180.48 |
| 1937 | 5265.85 |
| 1938 | 5323.91 |
| 1939 | 5359.45 |
| 1940 | 5382.54 |
| 1941 | 5387.85 |
| 1942 | 5434.44 |
| 1943 | 5402.78 |
| 1944 | 5416.09 |
| 1945 | 5434.5 |
| 1946 | 5408.97 |
| 1947 | 5405.94 |
| 1948 | 5402.63 |
| 1949 | 5439.68 |
| 1950 | 5475.93 |
| 1951 | 5504.74 |
| 1952 | 5508.89 |
| 1953 | 5528.6 |
| 1954 | 5468.89 |
| 1955 | 5425.69 |
| 1956 | 5328.82 |
| 1957 | 5223.77 |
| 1958 | 5195.95 |
| 1959 | 5210.69 |
| 1960 | 5304.27 |
| 1961 | 5319.48 |
| 1962 | 5177.09 |
| 1963 | 5020.89 |
| 1964 | 4994.34 |
| 1965 | 4959.57 |
| 1966 | 5181.66 |
| 1967 | 5052.06 |
| 1968 | 4901.19 |
| 1969 | 4779.39 |
| 1970 | 5106.81 |
| 1971 | 4927.01 |
| 1972 | 4731.32 |
| 1973 | 4557.4 |
| 1974 | 4438.78 |
| 1975 | 4395.99 |
| 1976 | 4352.4 |
| 1977 | 4397.16 |
| 1978 | 4413.78 |
| 1979 | 4410.77 |
| 1980 | 4527.09 |
| 1981 | 4692.54 |
| 1982 | 4761.04 |
| 1983 | 4851.05 |
| 1984 | 4984.84 |
| 1985 | 5078.56 |
| 1986 | 5122.26 |
| 1987 | 5089.7 |
| 1988 | 5132.32 |
| 1989 | 5156.99 |
| 1990 | 5191.31 |
| 1991 | 5219.04 |
| 1992 | 5214.76 |
| 1993 | 5216.13 |
| 1994 | 5233.5 |
| 1995 | 5276.23 |
| 1996 | 5280.81 |
| 1997 | 5307.28 |
| 1998 | 5372.18 |
| 1999 | 5426.83 |
| 2000 | 5463.81 |
| 2001 | 5450.27 |
| 2002 | 5448.31 |
| 2003 | 5387.57 |
| 2004 | 5308.32 |
| 2005 | 5262.03 |
| 2006 | 5241.16 |
| 2007 | 5253.84 |
| 2008 | 5384.63 |
| 2009 | 5368.57 |
| 2010 | 5254.58 |
| 2011 | 5129.46 |
| 2012 | 4973.25 |
| 2013 | 4914.21 |
| 2014 | 5121.18 |
| 2015 | 5015.42 |
| 2016 | 4856.19 |
| 2017 | 4724.06 |
| 2018 | 5016.19 |
| 2019 | 4793.23 |
| 2020 | 4637.25 |
| 2021 | 4478.82 |
| 2022 | 4421.13 |
| 2023 | 4410.14 |
| 2024 | 4475.25 |
| 2025 | 4603.52 |
| 2026 | 4841.57 |
| 2027 | 5120.26 |
| 2028 | 5457.01 |
| 2029 | 5745.85 |
| 2030 | 5785.45 |
| 2031 | 5936.61 |
| 2032 | 6129.18 |
| 2033 | 6172.47 |
| 2034 | 6227.28 |
| 2035 | 6287.13 |
| 2036 | 6339.27 |
| 2037 | 6385.1 |
| 2038 | 6468.42 |
| 2039 | 6494.61 |
| 2040 | 6519.6 |
| 2041 | 6617.85 |
| 2042 | 6702.1 |
| 2043 | 6680.03 |
| 2044 | 6711.82 |
| 2045 | 6748.09 |
| 2046 | 6743.06 |
| 2047 | 6794.84 |
| 2048 | 6745.41 |
| 2049 | 6681.36 |
| 2050 | 6487.29 |
| 2051 | 6352.32 |
| 2052 | 6143.58 |
| 2053 | 5958.11 |
| 2054 | 5832.67 |
| 2055 | 5763.05 |
| 2056 | 5808.95 |
| 2057 | 5733.64 |
| 2058 | 5516.07 |
| 2059 | 5321.76 |
| 2060 | 5164.71 |
| 2061 | 5059.54 |
| 2062 | 5329.21 |
| 2063 | 5169.12 |
| 2064 | 4954.62 |
| 2065 | 4842.23 |
| 2066 | 5153.33 |
| 2067 | 5006.03 |
| 2068 | 4813.37 |
| 2069 | 4684.81 |
| 2070 | 4622.51 |
| 2071 | 4618.75 |
| 2072 | 4680.95 |
| 2073 | 4773.86 |
| 2074 | 5014.22 |
| 2075 | 5211.94 |
| 2076 | 5547.82 |
| 2077 | 5811.06 |
| 2078 | 5956.39 |
| 2079 | 6221.01 |
| 2080 | 6418.78 |
| 2081 | 6595.2 |
| 2082 | 6742.21 |
| 2083 | 6929.19 |
| 2084 | 7105.72 |
| 2085 | 7258.55 |
| 2086 | 7406.27 |
| 2087 | 7542.3 |
| 2088 | 7670.71 |
| 2089 | 7822.11 |
| 2090 | 7986.16 |
| 2091 | 8194.62 |
| 2092 | 8297.3 |
| 2093 | 8376.09 |
| 2094 | 8482.47 |
| 2095 | 8593.99 |
| 2096 | 8546.67 |
| 2097 | 8518.74 |
| 2098 | 8344.77 |
| 2099 | 8289.19 |
| 2100 | 8106.45 |
| 2101 | 7970.11 |
| 2102 | 7790.52 |
| 2103 | 7572.43 |
| 2104 | 7513.65 |
| 2105 | 7332.14 |
| 2106 | 7017.19 |
| 2107 | 6579.9 |
| 2108 | 6167.86 |
| 2109 | 5871.79 |
| 2110 | 6008.63 |
| 2111 | 5784.87 |
| 2112 | 5474.07 |
| 2113 | 5312.44 |
| 2114 | 5684.25 |
| 2115 | 5423.99 |
| 2116 | 5266.87 |
| 2117 | 5124.59 |
| 2118 | 5105.14 |
| 2119 | 5067.52 |
| 2120 | 5152.35 |
| 2121 | 5254.73 |
| 2122 | 5471.18 |
| 2123 | 5778.58 |
| 2124 | 6306.64 |
| 2125 | 6733.86 |
| 2126 | 7016.57 |
| 2127 | 7366.16 |
| 2128 | 7676.27 |
| 2129 | 7864.94 |
| 2130 | 7987.56 |
| 2131 | 8093.23 |
| 2132 | 8144.38 |
| 2133 | 8176.3 |
| 2134 | 8167.12 |
| 2135 | 8245.94 |
| 2136 | 8201.27 |
| 2137 | 8211.13 |
| 2138 | 8194.8 |
| 2139 | 8183.86 |
| 2140 | 8159.61 |
| 2141 | 8138.42 |
| 2142 | 8058.73 |
| 2143 | 8014.14 |
| 2144 | 7900.25 |
| 2145 | 7614.82 |
| 2146 | 7288.38 |
| 2147 | 7061.64 |
| 2148 | 6770.99 |
| 2149 | 6556.66 |
| 2150 | 6337.79 |
| 2151 | 6303.78 |
| 2152 | 6341.94 |
| 2153 | 6171.23 |
| 2154 | 5929.38 |
| 2155 | 5602.34 |
| 2156 | 5432.6 |
| 2157 | 5264.38 |
| 2158 | 5497.58 |
| 2159 | 5345.24 |
| 2160 | 5151.52 |
| 2161 | 4963.55 |
| 2162 | 5362.13 |
| 2163 | 5122.28 |
| 2164 | 4893.89 |
| 2165 | 4795.27 |
| 2166 | 4715.56 |
| 2167 | 4668.45 |
| 2168 | 4727.56 |
| 2169 | 4822.66 |
| 2170 | 4985.7 |
| 2171 | 5227.21 |
| 2172 | 5578.84 |
| 2173 | 5976.92 |
| 2174 | 6005.64 |
| 2175 | 6163.11 |
| 2176 | 6228.22 |
| 2177 | 6244.63 |
| 2178 | 6274.28 |
| 2179 | 6323 |
| 2180 | 6396.29 |
| 2181 | 6416.57 |
| 2182 | 6396.99 |
| 2183 | 6407.61 |
| 2184 | 6401.51 |
| 2185 | 6447.73 |
| 2186 | 6495.18 |
| 2187 | 6551.39 |
| 2188 | 6630.36 |
| 2189 | 6576.91 |
| 2190 | 6575.33 |
| 2191 | 6545.62 |
| 2192 | 6472.65 |
| 2193 | 6429.46 |
| 2194 | 6225.9 |
| 2195 | 6015.25 |
| 2196 | 5846.7 |
| 2197 | 5657.07 |
| 2198 | 5524.68 |
| 2199 | 5585.61 |
| 2200 | 5648.22 |
| 2201 | 5565.26 |
| 2202 | 5372.56 |
| 2203 | 5192.7 |
| 2204 | 5007.21 |
| 2205 | 4820.83 |
| 2206 | 5175.57 |
| 2207 | 5061.73 |
| 2208 | 4867.71 |
| 2209 | 4724.62 |
| 2210 | 5071.16 |
| 2211 | 4901.87 |
| 2212 | 4646.56 |
| 2213 | 4530.99 |
| 2214 | 4471.8 |
| 2215 | 4451.38 |
| 2216 | 4516.05 |
| 2217 | 4628.03 |
| 2218 | 4858.07 |
| 2219 | 5053.91 |
| 2220 | 5363.24 |
| 2221 | 5669.2 |
| 2222 | 5647.05 |
| 2223 | 5839.8 |
| 2224 | 5998.32 |
| 2225 | 6015.64 |
| 2226 | 6048.26 |
| 2227 | 6119.82 |
| 2228 | 6139.16 |
| 2229 | 6157.44 |
| 2230 | 6175.31 |
| 2231 | 6188.79 |
| 2232 | 6201.8 |
| 2233 | 6167.27 |
| 2234 | 6190.43 |
| 2235 | 6126.45 |
| 2236 | 6080.87 |
| 2237 | 5970.79 |
| 2238 | 6055.41 |
| 2239 | 6048.05 |
| 2240 | 6007.12 |
| 2241 | 5902.16 |
| 2242 | 5787.06 |
| 2243 | 5669.87 |
| 2244 | 5543.02 |
| 2245 | 5486.75 |
| 2246 | 5443.93 |
| 2247 | 5479.8 |
| 2248 | 5534.36 |
| 2249 | 5451.55 |
| 2250 | 5338.35 |
| 2251 | 5184.51 |
| 2252 | 5083.19 |
| 2253 | 5013.75 |
| 2254 | 5309.9 |
| 2255 | 5085.88 |
| 2256 | 4874.81 |
| 2257 | 4725.35 |
| 2258 | 5083.56 |
| 2259 | 4914.62 |
| 2260 | 4682.23 |
| 2261 | 4531.92 |
| 2262 | 4443.12 |
| 2263 | 4385.12 |
| 2264 | 4410.53 |
| 2265 | 4443.58 |
| 2266 | 4576.8 |
| 2267 | 4688.24 |
| 2268 | 4753.11 |
| 2269 | 4872.28 |
| 2270 | 4965.92 |
| 2271 | 5096.63 |
| 2272 | 5233.26 |
| 2273 | 5289.35 |
| 2274 | 5334.42 |
| 2275 | 5327.52 |
| 2276 | 5357.05 |
| 2277 | 5369.4 |
| 2278 | 5350.59 |
| 2279 | 5310.66 |
| 2280 | 5309.12 |
| 2281 | 5271.69 |
| 2282 | 5271.01 |
| 2283 | 5240.85 |
| 2284 | 5250.35 |
| 2285 | 5255.5 |
| 2286 | 5267.69 |
| 2287 | 5296.36 |
| 2288 | 5307.1 |
| 2289 | 5303.53 |
| 2290 | 5269.06 |
| 2291 | 5212.51 |
| 2292 | 5130.47 |
| 2293 | 5073.93 |
| 2294 | 5012.4 |
| 2295 | 5023.61 |
| 2296 | 5148.9 |
| 2297 | 5169.04 |
| 2298 | 5053.11 |
| 2299 | 4981.2 |
| 2300 | 4889.17 |
| 2301 | 4843.56 |
| 2302 | 5038.15 |
| 2303 | 4944.05 |
| 2304 | 4790.11 |
| 2305 | 4678.8 |
| 2306 | 5005.03 |
| 2307 | 4843.59 |
| 2308 | 4636.52 |
| 2309 | 4479.84 |
| 2310 | 4395.78 |
| 2311 | 4324.96 |
| 2312 | 4306.67 |
| 2313 | 4301.63 |
| 2314 | 4276.06 |
| 2315 | 4269.07 |
| 2316 | 4399.06 |
| 2317 | 4498.44 |
| 2318 | 4495.02 |
| 2319 | 4581.64 |
| 2320 | 4727.05 |
| 2321 | 4822.69 |
| 2322 | 4937.29 |
| 2323 | 5005.63 |
| 2324 | 5066.54 |
| 2325 | 5137.38 |
| 2326 | 5165.01 |
| 2327 | 5205.88 |
| 2328 | 5229.26 |
| 2329 | 5200.59 |
| 2330 | 5209.11 |
| 2331 | 5234.94 |
| 2332 | 5269.52 |
| 2333 | 5324.2 |
| 2334 | 5433.23 |
| 2335 | 5520.04 |
| 2336 | 5570.15 |
| 2337 | 5594.68 |
| 2338 | 5636.4 |
| 2339 | 5564.15 |
| 2340 | 5463.86 |
| 2341 | 5325.64 |
| 2342 | 5264.52 |
| 2343 | 5270.54 |
| 2344 | 5380.37 |
| 2345 | 5319.19 |
| 2346 | 5110.77 |
| 2347 | 4920.86 |
| 2348 | 4782.06 |
| 2349 | 4721.93 |
| 2350 | 4961.2 |
| 2351 | 4846.25 |
| 2352 | 4677.3 |
| 2353 | 4564.93 |
| 2354 | 4947.79 |
| 2355 | 4797.24 |
| 2356 | 4645.08 |
| 2357 | 4529.31 |
| 2358 | 4509.46 |
| 2359 | 4489.37 |
| 2360 | 4585.8 |
| 2361 | 4720.54 |
| 2362 | 4970.52 |
| 2363 | 5208 |
| 2364 | 5562.47 |
| 2365 | 5872.85 |
| 2366 | 5994.35 |
| 2367 | 6199.11 |
| 2368 | 6428.99 |
| 2369 | 6629.48 |
| 2370 | 6797.21 |
| 2371 | 6972.06 |
| 2372 | 7176.91 |
| 2373 | 7376.3 |
| 2374 | 7483.81 |
| 2375 | 7589.03 |
| 2376 | 7738.24 |
| 2377 | 7947.1 |
| 2378 | 8065.85 |
| 2379 | 8136.08 |
| 2380 | 8287.29 |
| 2381 | 8401.98 |
| 2382 | 8477.17 |
| 2383 | 8593.92 |
| 2384 | 8602.64 |
| 2385 | 8559.36 |
| 2386 | 8338.49 |
| 2387 | 8145.29 |
| 2388 | 7907.11 |
| 2389 | 7688.43 |
| 2390 | 7367.18 |
| 2391 | 7099.58 |
| 2392 | 6984 |
| 2393 | 6776.45 |
| 2394 | 6403.81 |
| 2395 | 6030.77 |
| 2396 | 5748.53 |
| 2397 | 5558.48 |
| 2398 | 5775.18 |
| 2399 | 5544.15 |
| 2400 | 5261.8 |
| 2401 | 5161.66 |
| 2402 | 5508.31 |
| 2403 | 5305.64 |
| 2404 | 5096.7 |
| 2405 | 4975.01 |
| 2406 | 4880.98 |
| 2407 | 4862.8 |
| 2408 | 4960.04 |
| 2409 | 5088.36 |
| 2410 | 5333.02 |
| 2411 | 5518.58 |
| 2412 | 5955.36 |
| 2413 | 6287.14 |
| 2414 | 6485.8 |
| 2415 | 6843.52 |
| 2416 | 7217.46 |
| 2417 | 7477.06 |
| 2418 | 7746.58 |
| 2419 | 8029.24 |
| 2420 | 8277.29 |
| 2421 | 8518.57 |
| 2422 | 8740.26 |
| 2423 | 8926.51 |
| 2424 | 9069.31 |
| 2425 | 9190.98 |
| 2426 | 9179.75 |
| 2427 | 9004.09 |
| 2428 | 8883.18 |
| 2429 | 8777.45 |
| 2430 | 8638.7 |
| 2431 | 8507.8 |
| 2432 | 8339.21 |
| 2433 | 8133.91 |
| 2434 | 7754.86 |
| 2435 | 7536.29 |
| 2436 | 7264.48 |
| 2437 | 7003.73 |
| 2438 | 6794.07 |
| 2439 | 6610.13 |
| 2440 | 6625.88 |
| 2441 | 6442.93 |
| 2442 | 6142.36 |
| 2443 | 5765.5 |
| 2444 | 5488.92 |
| 2445 | 5359.98 |
| 2446 | 5582.56 |
| 2447 | 5415.12 |
| 2448 | 5225.71 |
| 2449 | 5106.12 |
| 2450 | 5459 |
| 2451 | 5231.68 |
| 2452 | 5024.87 |
| 2453 | 4893.88 |
| 2454 | 4838.39 |
| 2455 | 4821.21 |
| 2456 | 4919.98 |
| 2457 | 5022.59 |
| 2458 | 5250.27 |
| 2459 | 5523.34 |
| 2460 | 5947.78 |
| 2461 | 6262.94 |
| 2462 | 6416.13 |
| 2463 | 6617.98 |
| 2464 | 6825.28 |
| 2465 | 6946.59 |
| 2466 | 7027.01 |
| 2467 | 7162.57 |
| 2468 | 7287.93 |
| 2469 | 7387.13 |
| 2470 | 7438.45 |
| 2471 | 7506.47 |
| 2472 | 7602.35 |
| 2473 | 7729.3 |
| 2474 | 7742.87 |
| 2475 | 7751.1 |
| 2476 | 7792.46 |
| 2477 | 7818.6 |
| 2478 | 7873.81 |
| 2479 | 7919.01 |
| 2480 | 7872.2 |
| 2481 | 7727.27 |
| 2482 | 7448.54 |
| 2483 | 7211.06 |
| 2484 | 6906.84 |
| 2485 | 6711.08 |
| 2486 | 6497.37 |
| 2487 | 6435.58 |
| 2488 | 6423.38 |
| 2489 | 6307.16 |
| 2490 | 6038.09 |
| 2491 | 5762.71 |
| 2492 | 5556.49 |
| 2493 | 5397.49 |
| 2494 | 5668.94 |
| 2495 | 5461.94 |
| 2496 | 5197.84 |
| 2497 | 5037.17 |
| 2498 | 5387.43 |
| 2499 | 5178.92 |
| 2500 | 4970.56 |
| 2501 | 4856.94 |
| 2502 | 4775.08 |
| 2503 | 4754.21 |
| 2504 | 4841.07 |
| 2505 | 4991.82 |
| 2506 | 5300.81 |
| 2507 | 5594.22 |
| 2508 | 6085.02 |
| 2509 | 6503.23 |
| 2510 | 6707.24 |
| 2511 | 6964.3 |
| 2512 | 7202.88 |
| 2513 | 7349.67 |
| 2514 | 7609.14 |
| 2515 | 7847.1 |
| 2516 | 8038.54 |
| 2517 | 8135 |
| 2518 | 8188.74 |
| 2519 | 8219.05 |
| 2520 | 8275.92 |
| 2521 | 8296.25 |
| 2522 | 8352.72 |
| 2523 | 8343.6 |
| 2524 | 8331.47 |
| 2525 | 8201.38 |
| 2526 | 7987.08 |
| 2527 | 7866.68 |
| 2528 | 7644.69 |
| 2529 | 7512.23 |
| 2530 | 7183.47 |
| 2531 | 6888.99 |
| 2532 | 6599.97 |
| 2533 | 6366.22 |
| 2534 | 6181.49 |
| 2535 | 6119.26 |
| 2536 | 6099.99 |
| 2537 | 5950.75 |
| 2538 | 5709.99 |
| 2539 | 5465.06 |
| 2540 | 5228.35 |
| 2541 | 5078.06 |
| 2542 | 5330.31 |
| 2543 | 5146.97 |
| 2544 | 4929.55 |
| 2545 | 4836.95 |
| 2546 | 5202.86 |
| 2547 | 5021.48 |
| 2548 | 4868.81 |
| 2549 | 4745.21 |
| 2550 | 4684.29 |
| 2551 | 4688.7 |
| 2552 | 4721.98 |
| 2553 | 4848.74 |
| 2554 | 5072.42 |
| 2555 | 5264.37 |
| 2556 | 5690.9 |
| 2557 | 6003.86 |
| 2558 | 6010.42 |
| 2559 | 6224.91 |
| 2560 | 6343.91 |
| 2561 | 6373.95 |
| 2562 | 6429.47 |
| 2563 | 6570.13 |
| 2564 | 6638.96 |
| 2565 | 6661.75 |
| 2566 | 6732.73 |
| 2567 | 6818.56 |
| 2568 | 6901.51 |
| 2569 | 6930.19 |
| 2570 | 6821.55 |
| 2571 | 7051.26 |
| 2572 | 7078.15 |
| 2573 | 7184.31 |
| 2574 | 7196.58 |
| 2575 | 7225.44 |
| 2576 | 7229.84 |
| 2577 | 7212.6 |
| 2578 | 7014.62 |
| 2579 | 6866.02 |
| 2580 | 6636.73 |
| 2581 | 6460.72 |
| 2582 | 6264.2 |
| 2583 | 6184.31 |
| 2584 | 6161.89 |
| 2585 | 6004.92 |
| 2586 | 5820.65 |
| 2587 | 5578.08 |
| 2588 | 5436.98 |
| 2589 | 5399.06 |
| 2590 | 5667.77 |
| 2591 | 5482.09 |
| 2592 | 5178.33 |
| 2593 | 4975.51 |
| 2594 | 5295.36 |
| 2595 | 5042.64 |
| 2596 | 4799.89 |
| 2597 | 4655.63 |
| 2598 | 4567.42 |
| 2599 | 4507.62 |
| 2600 | 4504.09 |
| 2601 | 4539.48 |
| 2602 | 4629.55 |
| 2603 | 4681.25 |
| 2604 | 4787.04 |
| 2605 | 5000.85 |
| 2606 | 5095.24 |
| 2607 | 5220.79 |
| 2608 | 5299.81 |
| 2609 | 5371.84 |
| 2610 | 5423.96 |
| 2611 | 5465.44 |
| 2612 | 5479.05 |
| 2613 | 5491.54 |
| 2614 | 5490.61 |
| 2615 | 5485.24 |
| 2616 | 5484.79 |
| 2617 | 5502.38 |
| 2618 | 5473.38 |
| 2619 | 5462.73 |
| 2620 | 5463.22 |
| 2621 | 5500.93 |
| 2622 | 5533.03 |
| 2623 | 5574.11 |
| 2624 | 5588.47 |
| 2625 | 5592.48 |
| 2626 | 5588.1 |
| 2627 | 5486.97 |
| 2628 | 5403.64 |
| 2629 | 5323.03 |
| 2630 | 5223.31 |
| 2631 | 5240.87 |
| 2632 | 5370.04 |
| 2633 | 5290.89 |
| 2634 | 5198.83 |
| 2635 | 5043.97 |
| 2636 | 4993.82 |
| 2637 | 4985.05 |
| 2638 | 5226.33 |
| 2639 | 5091.76 |
| 2640 | 4862.51 |
| 2641 | 4700.78 |
| 2642 | 5055.48 |
| 2643 | 4886.16 |
| 2644 | 4671.91 |
| 2645 | 4528.16 |
| 2646 | 4448.44 |
| 2647 | 4409.87 |
| 2648 | 4380.02 |
| 2649 | 4390.38 |
| 2650 | 4406.84 |
| 2651 | 4393.48 |
| 2652 | 4524.03 |
| 2653 | 4648.82 |
| 2654 | 4713.18 |
| 2655 | 4877.51 |
| 2656 | 4993.87 |
| 2657 | 5028.44 |
| 2658 | 5152.49 |
| 2659 | 5226.88 |
| 2660 | 5264.29 |
| 2661 | 5347.01 |
| 2662 | 5385.99 |
| 2663 | 5406.88 |
| 2664 | 5425.62 |
| 2665 | 5446.61 |
| 2666 | 5486.87 |
| 2667 | 5530.7 |
| 2668 | 5586.68 |
| 2669 | 5665.64 |
| 2670 | 5714.1 |
| 2671 | 5762.83 |
| 2672 | 5768.25 |
| 2673 | 5786.29 |
| 2674 | 5767.61 |
| 2675 | 5693.28 |
| 2676 | 5574.58 |
| 2677 | 5448.82 |
| 2678 | 5356.91 |
| 2679 | 5341.14 |
| 2680 | 5460.71 |
| 2681 | 5412.15 |
| 2682 | 5276.38 |
| 2683 | 5159.61 |
| 2684 | 4997.34 |
| 2685 | 4861.69 |
| 2686 | 5070.21 |
| 2687 | 4900.8 |
| 2688 | 4739.84 |
| 2689 | 4632.34 |
| 2690 | 4984.42 |
| 2691 | 4810.68 |
| 2692 | 4607.89 |
| 2693 | 4456.01 |
| 2694 | 4390.26 |
| 2695 | 4360.33 |
| 2696 | 4359.05 |
| 2697 | 4394.77 |
| 2698 | 4442.21 |
| 2699 | 4458.88 |
| 2700 | 4588.75 |
| 2701 | 4722.74 |
| 2702 | 4724.76 |
| 2703 | 4795.64 |
| 2704 | 4902.49 |
| 2705 | 5004.85 |
| 2706 | 5144.57 |
| 2707 | 5197.29 |
| 2708 | 5223.83 |
| 2709 | 5362.18 |
| 2710 | 5508.16 |
| 2711 | 5589.8 |
| 2712 | 5616.07 |
| 2713 | 5637.89 |
| 2714 | 5681.75 |
| 2715 | 5748.58 |
| 2716 | 5761.61 |
| 2717 | 5760.74 |
| 2718 | 5746.08 |
| 2719 | 5950.1 |
| 2720 | 5972.96 |
| 2721 | 5972.99 |
| 2722 | 5901.51 |
| 2723 | 5801.96 |
| 2724 | 5647.98 |
| 2725 | 5536.73 |
| 2726 | 5424.56 |
| 2727 | 5455.9 |
| 2728 | 5493.75 |
| 2729 | 5419.24 |
| 2730 | 5242.21 |
| 2731 | 5056.44 |
| 2732 | 4919.22 |
| 2733 | 4860.58 |
| 2734 | 5141.46 |
| 2735 | 5038.72 |
| 2736 | 4842.87 |
| 2737 | 4743.78 |
| 2738 | 5090.53 |
| 2739 | 4917.06 |
| 2740 | 4731.54 |
| 2741 | 4613.65 |
| 2742 | 4556.86 |
| 2743 | 4558.5 |
| 2744 | 4611.15 |
| 2745 | 4748.6 |
| 2746 | 5048.25 |
| 2747 | 5301.56 |
| 2748 | 5693.44 |
| 2749 | 6039.61 |
| 2750 | 6130.72 |
| 2751 | 6296.54 |
| 2752 | 6555.31 |
| 2753 | 6739.12 |
| 2754 | 6950.51 |
| 2755 | 7143.85 |
| 2756 | 7354.78 |
| 2757 | 7574.97 |
| 2758 | 7727.09 |
| 2759 | 7924.13 |
| 2760 | 8095.39 |
| 2761 | 8237.65 |
| 2762 | 8366.84 |
| 2763 | 8464.91 |
| 2764 | 8593.48 |
| 2765 | 8690.06 |
| 2766 | 8760.99 |
| 2767 | 8881.74 |
| 2768 | 8897.72 |
| 2769 | 8839.16 |
| 2770 | 8613.74 |
| 2771 | 8453.95 |
| 2772 | 8234.44 |
| 2773 | 8000.06 |
| 2774 | 7753.31 |
| 2775 | 7542.05 |
| 2776 | 7486.66 |
| 2777 | 7176.79 |
| 2778 | 6733.82 |
| 2779 | 6274.95 |
| 2780 | 5952.37 |
| 2781 | 5682.31 |
| 2782 | 5880.26 |
| 2783 | 5618.35 |
| 2784 | 5337.61 |
| 2785 | 5187.76 |
| 2786 | 5508.81 |
| 2787 | 5325.74 |
| 2788 | 5094.27 |
| 2789 | 4963.69 |
| 2790 | 4908.96 |
| 2791 | 4914 |
| 2792 | 5041.92 |
| 2793 | 5187.6 |
| 2794 | 5471.91 |
| 2795 | 5649.76 |
| 2796 | 6066.36 |
| 2797 | 6448.76 |
| 2798 | 6643.97 |
| 2799 | 7051.98 |
| 2800 | 7416.02 |
| 2801 | 7680.5 |
| 2802 | 7995.88 |
| 2803 | 8391.3 |
| 2804 | 8733.58 |
| 2805 | 9015.28 |
| 2806 | 9192.62 |
| 2807 | 9407.31 |
| 2808 | 9661.01 |
| 2809 | 9787.56 |
| 2810 | 9754.11 |
| 2811 | 9943.56 |
| 2812 | 9926.91 |
| 2813 | 9876.25 |
| 2814 | 9988.96 |
| 2815 | 9968.35 |
| 2816 | 9987.86 |
| 2817 | 9890.7 |
| 2818 | 9615.5 |
| 2819 | 9605.01 |
| 2820 | 9376.84 |
| 2821 | 9137.05 |
| 2822 | 8933.17 |
| 2823 | 8850.31 |
| 2824 | 8796.27 |
| 2825 | 8541.94 |
| 2826 | 8107.24 |
| 2827 | 7593.45 |
| 2828 | 7164.4 |
| 2829 | 6827.17 |
| 2830 | 7003.79 |
| 2831 | 6628.2 |
| 2832 | 6256.23 |
| 2833 | 6052.68 |
| 2834 | 6368.77 |
| 2835 | 6059.32 |
| 2836 | 5794.62 |
| 2837 | 5671.34 |
| 2838 | 5619.94 |
| 2839 | 5645.16 |
| 2840 | 5787.26 |
| 2841 | 5982.52 |
| 2842 | 6407.5 |
| 2843 | 6729 |
| 2844 | 7277.76 |
| 2845 | 7780.27 |
| 2846 | 8153.42 |
| 2847 | 8508.55 |
| 2848 | 8863.87 |
| 2849 | 9114.6 |
| 2850 | 9369.46 |
| 2851 | 9828.21 |
| 2852 | 10074.64 |
| 2853 | 10215.69 |
| 2854 | 10221.45 |
| 2855 | 10289.6 |
| 2856 | 10414.86 |
| 2857 | 10317.25 |
| 2858 | 10162.83 |
| 2859 | 10346.02 |
| 2860 | 10117.56 |
| 2861 | 10062.27 |
| 2862 | 10149.48 |
| 2863 | 10385.75 |
| 2864 | 10340.08 |
| 2865 | 10234.31 |
| 2866 | 9899.7 |
| 2867 | 9799.41 |
| 2868 | 9501.92 |
| 2869 | 9314.71 |
| 2870 | 9134.47 |
| 2871 | 9120.02 |
| 2872 | 9064.1 |
| 2873 | 8826.16 |
| 2874 | 8443.83 |
| 2875 | 7967 |
| 2876 | 7526.67 |
| 2877 | 7212.63 |
| 2878 | 7362.64 |
| 2879 | 6998.63 |
| 2880 | 6627.49 |
| 2881 | 6473.88 |
| 2882 | 6777.04 |
| 2883 | 6439.36 |
| 2884 | 6185.98 |
| 2885 | 6032.6 |
| 2886 | 5981.09 |
| 2887 | 5954.89 |
| 2888 | 6036.39 |
| 2889 | 6173.94 |
| 2890 | 6442.66 |
| 2891 | 6736.23 |
| 2892 | 7196.18 |
| 2893 | 7637.28 |
| 2894 | 7919.28 |
| 2895 | 8331.49 |
| 2896 | 8784.44 |
| 2897 | 9098.87 |
| 2898 | 9390.66 |
| 2899 | 9657.94 |
| 2900 | 9830.19 |
| 2901 | 10028.92 |
| 2902 | 10157.84 |
| 2903 | 10264.97 |
| 2904 | 10331.54 |
| 2905 | 10090.82 |
| 2906 | 10112.67 |
| 2907 | 10106.14 |
| 2908 | 9880.57 |
| 2909 | 9951.94 |
| 2910 | 10059.73 |
| 2911 | 10175.54 |
| 2912 | 10129.58 |
| 2913 | 10003.78 |
| 2914 | 9623.9 |
| 2915 | 8557.12 |
| 2916 | 7889.61 |
| 2917 | 7781.25 |
| 2918 | 7689.05 |
| 2919 | 7865.31 |
| 2920 | 7849.97 |
| 2921 | 7690.32 |
| 2922 | 7347.62 |
| 2923 | 7026.03 |
| 2924 | 6797.68 |
| 2925 | 6670.12 |
| 2926 | 6771.34 |
| 2927 | 6378.47 |
| 2928 | 6037.42 |
| 2929 | 5825.9 |
| 2930 | 6179.31 |
| 2931 | 5868.57 |
| 2932 | 5601.37 |
| 2933 | 5491.58 |
| 2934 | 5455.18 |
| 2935 | 5426.32 |
| 2936 | 5444.71 |
| 2937 | 5480.62 |
| 2938 | 5534.73 |
| 2939 | 5542.29 |
| 2940 | 5667.47 |
| 2941 | 5821.43 |
| 2942 | 6003.07 |
| 2943 | 6274.15 |
| 2944 | 6618.62 |
| 2945 | 6907.8 |
| 2946 | 7204.37 |
| 2947 | 7462.02 |
| 2948 | 7636.58 |
| 2949 | 7767.06 |
| 2950 | 7904.9 |
| 2951 | 8007.15 |
| 2952 | 8006.45 |
| 2953 | 7974.79 |
| 2954 | 7914.82 |
| 2955 | 7907.15 |
| 2956 | 7943.5 |
| 2957 | 7969.57 |
| 2958 | 7964.04 |
| 2959 | 7930.79 |
| 2960 | 7792.24 |
| 2961 | 7580.35 |
| 2962 | 7363.98 |
| 2963 | 7086.77 |
| 2964 | 6829.91 |
| 2965 | 6579.54 |
| 2966 | 6425.23 |
| 2967 | 6393.4 |
| 2968 | 6380.79 |
| 2969 | 6226.07 |
| 2970 | 6029.87 |
| 2971 | 5802.06 |
| 2972 | 5664.25 |
| 2973 | 5548.84 |
| 2974 | 5707.25 |
| 2975 | 5491.91 |
| 2976 | 5286.29 |
| 2977 | 5154.4 |
| 2978 | 5487.78 |
| 2979 | 5256.39 |
| 2980 | 5055.21 |
| 2981 | 4945.58 |
| 2982 | 4837.82 |
| 2983 | 4757.66 |
| 2984 | 4751.68 |
| 2985 | 4761.2 |
| 2986 | 4799.53 |
| 2987 | 4804.08 |
| 2988 | 4892.47 |
| 2989 | 5054.61 |
| 2990 | 5161.46 |
| 2991 | 5287.85 |
| 2992 | 5469.46 |
| 2993 | 5628.25 |
| 2994 | 5779.89 |
| 2995 | 5880.76 |
| 2996 | 6049.26 |
| 2997 | 6269.73 |
| 2998 | 6454.89 |
| 2999 | 6584.71 |
| 3000 | 6687.09 |
| 3001 | 6790.83 |
| 3002 | 6826.09 |
| 3003 | 6873.62 |
| 3004 | 6979.2 |
| 3005 | 7075.31 |
| 3006 | 7124.01 |
| 3007 | 7164.79 |
| 3008 | 7136.13 |
| 3009 | 7212.86 |
| 3010 | 7222.27 |
| 3011 | 7163.48 |
| 3012 | 7042.4 |
| 3013 | 6844.96 |
| 3014 | 6662.53 |
| 3015 | 6582.48 |
| 3016 | 6523.71 |
| 3017 | 6315.02 |
| 3018 | 6069.69 |
| 3019 | 5854.18 |
| 3020 | 5692.96 |
| 3021 | 5582.1 |
| 3022 | 5775.85 |
| 3023 | 5538.92 |
| 3024 | 5290.96 |
| 3025 | 5162.42 |
| 3026 | 5545.46 |
| 3027 | 5354.63 |
| 3028 | 5184.24 |
| 3029 | 5056.8 |
| 3030 | 4999.16 |
| 3031 | 5019.13 |
| 3032 | 5158.66 |
| 3033 | 5329.28 |
| 3034 | 5705.1 |
| 3035 | 6054.69 |
| 3036 | 6489.61 |
| 3037 | 6853.49 |
| 3038 | 6917.69 |
| 3039 | 7043.41 |
| 3040 | 7175.29 |
| 3041 | 7289.91 |
| 3042 | 7400.62 |
| 3043 | 7484.12 |
| 3044 | 7561.28 |
| 3045 | 7671.66 |
| 3046 | 7722.5 |
| 3047 | 7756.22 |
| 3048 | 7772.7 |
| 3049 | 7914.65 |
| 3050 | 7912.22 |
| 3051 | 7975.19 |
| 3052 | 7994.66 |
| 3053 | 8027.2 |
| 3054 | 8114.62 |
| 3055 | 8167.08 |
| 3056 | 8014.76 |
| 3057 | 7806.39 |
| 3058 | 7517.7 |
| 3059 | 7230.66 |
| 3060 | 6922.63 |
| 3061 | 6720.95 |
| 3062 | 6595.56 |
| 3063 | 6551.98 |
| 3064 | 6510.94 |
| 3065 | 6307.43 |
| 3066 | 6009.4 |
| 3067 | 5706.91 |
| 3068 | 5516.33 |
| 3069 | 5388.51 |
| 3070 | 5640.43 |
| 3071 | 5461.63 |
| 3072 | 5197.66 |
| 3073 | 5076.81 |
| 3074 | 5485.62 |
| 3075 | 5247.06 |
| 3076 | 5043.48 |
| 3077 | 4927.14 |
| 3078 | 4903.11 |
| 3079 | 4905.87 |
| 3080 | 5010.52 |
| 3081 | 5171.52 |
| 3082 | 5465.4 |
| 3083 | 5803.05 |
| 3084 | 6348.13 |
| 3085 | 6710.19 |
| 3086 | 6688.05 |
| 3087 | 6859.54 |
| 3088 | 7001.4 |
| 3089 | 7114.3 |
| 3090 | 7174.19 |
| 3091 | 7292.25 |
| 3092 | 7376.23 |
| 3093 | 7474.8 |
| 3094 | 7574.15 |
| 3095 | 7662.52 |
| 3096 | 7765.74 |
| 3097 | 7864.05 |
| 3098 | 7946.78 |
| 3099 | 7974.51 |
| 3100 | 7960.95 |
| 3101 | 7985.44 |
| 3102 | 8074.07 |
| 3103 | 8152.75 |
| 3104 | 8097.98 |
| 3105 | 7928.59 |
| 3106 | 7607.47 |
| 3107 | 7327.31 |
| 3108 | 7035.49 |
| 3109 | 6818.72 |
| 3110 | 6600 |
| 3111 | 6538.95 |
| 3112 | 6501.16 |
| 3113 | 6304.3 |
| 3114 | 6037.09 |
| 3115 | 5759.41 |
| 3116 | 5533.22 |
| 3117 | 5441.54 |
| 3118 | 5688.49 |
| 3119 | 5506.31 |
| 3120 | 5264.29 |
| 3121 | 5111.73 |
| 3122 | 5429.55 |
| 3123 | 5210.09 |
| 3124 | 4998.27 |
| 3125 | 4885.29 |
| 3126 | 4862.38 |
| 3127 | 4857.92 |
| 3128 | 4968.92 |
| 3129 | 5128.17 |
| 3130 | 5500.25 |
| 3131 | 5807.3 |
| 3132 | 6296.61 |
| 3133 | 6611.89 |
| 3134 | 6594.27 |
| 3135 | 6712.25 |
| 3136 | 6854.53 |
| 3137 | 6976.2 |
| 3138 | 7139.19 |
| 3139 | 7147.51 |
| 3140 | 7506.54 |
| 3141 | 7684.44 |
| 3142 | 7812.73 |
| 3143 | 7952.76 |
| 3144 | 8073.22 |
| 3145 | 8154.2 |
| 3146 | 8310.78 |
| 3147 | 8382.79 |
| 3148 | 8395.65 |
| 3149 | 8424.06 |
| 3150 | 8577.87 |
| 3151 | 8736.4 |
| 3152 | 8772.05 |
| 3153 | 8667.95 |
| 3154 | 8394.11 |
| 3155 | 8204.78 |
| 3156 | 7893.35 |
| 3157 | 7677.68 |
| 3158 | 7436.34 |
| 3159 | 7332.35 |
| 3160 | 7280.23 |
| 3161 | 7014.47 |
| 3162 | 6626.68 |
| 3163 | 6234.52 |
| 3164 | 5908.17 |
| 3165 | 5689.48 |
| 3166 | 5903.34 |
| 3167 | 5708.74 |
| 3168 | 5418.08 |
| 3169 | 5284.32 |
| 3170 | 5649.96 |
| 3171 | 5400.97 |
| 3172 | 5200.82 |
| 3173 | 5075.71 |
| 3174 | 5010.88 |
| 3175 | 5014.74 |
| 3176 | 5087.81 |
| 3177 | 5246.38 |
| 3178 | 5572.39 |
| 3179 | 5849.01 |
| 3180 | 6360.87 |
| 3181 | 6728.01 |
| 3182 | 6790.66 |
| 3183 | 7020.93 |
| 3184 | 7352.31 |
| 3185 | 7598.04 |
| 3186 | 7863.75 |
| 3187 | 8043.18 |
| 3188 | 8187.66 |
| 3189 | 8312.03 |
| 3190 | 8373.34 |
| 3191 | 8432.75 |
| 3192 | 8505.19 |
| 3193 | 8581.23 |
| 3194 | 8556.52 |
| 3195 | 8574.52 |
| 3196 | 8484.19 |
| 3197 | 8435.84 |
| 3198 | 8434.82 |
| 3199 | 8444.89 |
| 3200 | 8325.19 |
| 3201 | 8171.97 |
| 3202 | 7904.84 |
| 3203 | 7653.85 |
| 3204 | 7361.5 |
| 3205 | 7108.97 |
| 3206 | 6908.86 |
| 3207 | 6851.39 |
| 3208 | 6734.16 |
| 3209 | 6482.7 |
| 3210 | 6222.36 |
| 3211 | 5941.4 |
| 3212 | 5683.22 |
| 3213 | 5557.55 |
| 3214 | 5786.73 |
| 3215 | 5541.6 |
| 3216 | 5298.99 |
| 3217 | 5158.92 |
| 3218 | 5522.25 |
| 3219 | 5275.84 |
| 3220 | 5097.18 |
| 3221 | 4966.51 |
| 3222 | 4917.77 |
| 3223 | 4922.65 |
| 3224 | 5021.41 |
| 3225 | 5164.59 |
| 3226 | 5490 |
| 3227 | 5822.37 |
| 3228 | 6278.36 |
| 3229 | 6655.77 |
| 3230 | 6662.38 |
| 3231 | 6743.41 |
| 3232 | 6840.28 |
| 3233 | 6928.09 |
| 3234 | 7026.3 |
| 3235 | 6980.61 |
| 3236 | 7326.35 |
| 3237 | 7482.57 |
| 3238 | 7531.14 |
| 3239 | 7698.83 |
| 3240 | 7797.13 |
| 3241 | 7932.21 |
| 3242 | 8061.87 |
| 3243 | 8137.1 |
| 3244 | 8202.37 |
| 3245 | 8308.72 |
| 3246 | 8426.63 |
| 3247 | 8467.97 |
| 3248 | 8283.71 |
| 3249 | 8217.28 |
| 3250 | 7945.27 |
| 3251 | 7684.26 |
| 3252 | 7427.11 |
| 3253 | 7220.66 |
| 3254 | 7085.33 |
| 3255 | 7039.13 |
| 3256 | 6922.33 |
| 3257 | 6729.84 |
| 3258 | 6489.5 |
| 3259 | 6236.28 |
| 3260 | 5990.41 |
| 3261 | 5831.41 |
| 3262 | 5991.2 |
| 3263 | 5711.1 |
| 3264 | 5513.43 |
| 3265 | 5372.92 |
| 3266 | 5728.4 |
| 3267 | 5451.63 |
| 3268 | 5277.17 |
| 3269 | 5202.59 |
| 3270 | 5146.35 |
| 3271 | 5142.23 |
| 3272 | 5160.57 |
| 3273 | 5157.45 |
| 3274 | 5291.71 |
| 3275 | 5333.17 |
| 3276 | 5518.49 |
| 3277 | 5783 |
| 3278 | 6027.88 |
| 3279 | 6399.92 |
| 3280 | 6873.06 |
| 3281 | 7307.58 |
| 3282 | 7730.41 |
| 3283 | 8064.65 |
| 3284 | 8304.17 |
| 3285 | 8532.32 |
| 3286 | 8668.75 |
| 3287 | 8738.75 |
| 3288 | 8812.41 |
| 3289 | 8888.81 |
| 3290 | 8912.11 |
| 3291 | 8934.22 |
| 3292 | 8976.45 |
| 3293 | 8953.32 |
| 3294 | 8983.78 |
| 3295 | 8965.33 |
| 3296 | 8733.88 |
| 3297 | 8308.21 |
| 3298 | 7987.96 |
| 3299 | 7673.45 |
| 3300 | 7519.87 |
| 3301 | 7362.06 |
| 3302 | 7259.58 |
| 3303 | 7269.44 |
| 3304 | 7310.87 |
| 3305 | 7131.26 |
| 3306 | 6894.47 |
| 3307 | 6509.83 |
| 3308 | 6161.1 |
| 3309 | 5943.88 |
| 3310 | 5964.67 |
| 3311 | 5660.21 |
| 3312 | 5349.46 |
| 3313 | 5178.84 |
| 3314 | 5429.61 |
| 3315 | 5092.88 |
| 3316 | 4815.76 |
| 3317 | 4775.22 |
| 3318 | 4730.48 |
| 3319 | 4659.12 |
| 3320 | 4679.92 |
| 3321 | 4681.1 |
| 3322 | 4689.48 |
| 3323 | 4640.65 |
| 3324 | 4705.91 |
| 3325 | 4822.97 |
| 3326 | 4938.97 |
| 3327 | 5050.43 |
| 3328 | 5209.14 |
| 3329 | 5358.34 |
| 3330 | 5478.38 |
| 3331 | 5569.69 |
| 3332 | 5595.94 |
| 3333 | 5618.07 |
| 3334 | 5640.66 |
| 3335 | 5545.07 |
| 3336 | 5502.65 |
| 3337 | 5482.52 |
| 3338 | 5497.44 |
| 3339 | 5504.57 |
| 3340 | 5553.93 |
| 3341 | 5541.26 |
| 3342 | 5581.75 |
| 3343 | 5539.69 |
| 3344 | 5564 |
| 3345 | 5591.05 |
| 3346 | 5476.05 |
| 3347 | 5415.46 |
| 3348 | 5335.96 |
| 3349 | 5304.99 |
| 3350 | 5340.61 |
| 3351 | 5389.21 |
| 3352 | 5448.34 |
| 3353 | 5313.84 |
| 3354 | 5165.25 |
| 3355 | 4990.75 |
| 3356 | 4852.53 |
| 3357 | 4757.35 |
| 3358 | 4997.2 |
| 3359 | 4902.45 |
| 3360 | 4690.56 |
| 3361 | 4554.44 |
| 3362 | 4978.37 |
| 3363 | 4825.11 |
| 3364 | 4615.89 |
| 3365 | 4474.01 |
| 3366 | 4409.76 |
| 3367 | 4451.28 |
| 3368 | 4555.94 |
| 3369 | 4722.53 |
| 3370 | 5106.23 |
| 3371 | 5434.91 |
| 3372 | 5813.33 |
| 3373 | 6109.75 |
| 3374 | 6104.91 |
| 3375 | 6136.78 |
| 3376 | 6267 |
| 3377 | 6329.68 |
| 3378 | 6391.1 |
| 3379 | 6393.96 |
| 3380 | 6429.77 |
| 3381 | 6428.98 |
| 3382 | 6411.09 |
| 3383 | 6407.22 |
| 3384 | 6472.62 |
| 3385 | 6502.11 |
| 3386 | 6462.84 |
| 3387 | 6463.25 |
| 3388 | 6473.8 |
| 3389 | 6456.21 |
| 3390 | 6460.46 |
| 3391 | 6449.73 |
| 3392 | 6437.25 |
| 3393 | 6340.65 |
| 3394 | 6123.96 |
| 3395 | 5979.64 |
| 3396 | 5758.86 |
| 3397 | 5648.98 |
| 3398 | 5607.28 |
| 3399 | 5718.53 |
| 3400 | 5695.52 |
| 3401 | 5600.57 |
| 3402 | 5401.66 |
| 3403 | 5212.92 |
| 3404 | 5063.22 |
| 3405 | 4953.68 |
| 3406 | 5267.61 |
| 3407 | 5147.33 |
| 3408 | 4958.24 |
| 3409 | 4776.84 |
| 3410 | 5157.18 |
| 3411 | 4967.52 |
| 3412 | 4731.33 |
| 3413 | 4569.77 |
| 3414 | 4527.57 |
| 3415 | 4535.87 |
| 3416 | 4658.44 |
| 3417 | 4811.07 |
| 3418 | 5161.9 |
| 3419 | 5490.8 |
| 3420 | 5959.29 |
| 3421 | 6240.19 |
| 3422 | 6202.4 |
| 3423 | 6206.88 |
| 3424 | 6285.09 |
| 3425 | 6314.1 |
| 3426 | 6278.48 |
| 3427 | 6296.22 |
| 3428 | 6386.57 |
| 3429 | 6414.74 |
| 3430 | 6367.29 |
| 3431 | 6359.89 |
| 3432 | 6405.92 |
| 3433 | 6417.49 |
| 3434 | 6386.11 |
| 3435 | 6344.87 |
| 3436 | 6289.8 |
| 3437 | 6284.75 |
| 3438 | 6312.2 |
| 3439 | 6272.02 |
| 3440 | 6215.35 |
| 3441 | 6171.49 |
| 3442 | 5989.27 |
| 3443 | 5867.68 |
| 3444 | 5701.92 |
| 3445 | 5616.52 |
| 3446 | 5624.42 |
| 3447 | 5719.23 |
| 3448 | 5689.83 |
| 3449 | 5588.18 |
| 3450 | 5429.16 |
| 3451 | 5155.98 |
| 3452 | 4987.77 |
| 3453 | 4852.24 |
| 3454 | 5073.39 |
| 3455 | 4989.64 |
| 3456 | 4800.12 |
| 3457 | 4673.39 |
| 3458 | 4987.41 |
| 3459 | 4853.25 |
| 3460 | 4644.94 |
| 3461 | 4545 |
| 3462 | 4510.26 |
| 3463 | 4480.38 |
| 3464 | 4531.36 |
| 3465 | 4661.86 |
| 3466 | 5049.71 |
| 3467 | 5415.19 |
| 3468 | 5912.27 |
| 3469 | 6232.32 |
| 3470 | 6194.21 |
| 3471 | 6196.83 |
| 3472 | 6279.95 |
| 3473 | 6309.39 |
| 3474 | 6314.36 |
| 3475 | 6379.45 |
| 3476 | 6366.04 |
| 3477 | 6379.49 |
| 3478 | 6396.8 |
| 3479 | 6384.07 |
| 3480 | 6383.32 |
| 3481 | 6397.43 |
| 3482 | 6381.19 |
| 3483 | 6320.19 |
| 3484 | 6291.18 |
| 3485 | 6235.31 |
| 3486 | 6265.85 |
| 3487 | 6286.25 |
| 3488 | 6239.14 |
| 3489 | 6167.4 |
| 3490 | 6027.11 |
| 3491 | 5908.56 |
| 3492 | 5794.14 |
| 3493 | 5744.24 |
| 3494 | 5690.29 |
| 3495 | 5751.57 |
| 3496 | 5737.27 |
| 3497 | 5609.54 |
| 3498 | 5417.28 |
| 3499 | 5124.5 |
| 3500 | 4962.72 |
| 3501 | 4865.99 |
| 3502 | 5068.83 |
| 3503 | 4974.61 |
| 3504 | 4799.81 |
| 3505 | 4650.77 |
| 3506 | 4994.18 |
| 3507 | 4840.65 |
| 3508 | 4692.66 |
| 3509 | 4545.26 |
| 3510 | 4489.31 |
| 3511 | 4481.49 |
| 3512 | 4569.68 |
| 3513 | 4692.35 |
| 3514 | 5026.56 |
| 3515 | 5378.88 |
| 3516 | 5894.07 |
| 3517 | 6211.33 |
| 3518 | 6162.47 |
| 3519 | 6174.15 |
| 3520 | 6232.99 |
| 3521 | 6313.41 |
| 3522 | 6328.94 |
| 3523 | 6334.97 |
| 3524 | 6307.97 |
| 3525 | 6353.54 |
| 3526 | 6318.9 |
| 3527 | 6347.76 |
| 3528 | 6375.55 |
| 3529 | 6390.53 |
| 3530 | 6353.82 |
| 3531 | 6351.81 |
| 3532 | 6317.67 |
| 3533 | 6328.71 |
| 3534 | 6330.3 |
| 3535 | 6295.61 |
| 3536 | 6269.97 |
| 3537 | 6199.81 |
| 3538 | 6015.66 |
| 3539 | 5835.24 |
| 3540 | 5684.05 |
| 3541 | 5606.68 |
| 3542 | 5594.62 |
| 3543 | 5737.31 |
| 3544 | 5699.8 |
| 3545 | 5495 |
| 3546 | 5258.13 |
| 3547 | 5018.37 |
| 3548 | 4871.86 |
| 3549 | 4756.24 |
| 3550 | 5051.82 |
| 3551 | 4922.8 |
| 3552 | 4734.33 |
| 3553 | 4617.46 |
| 3554 | 4948.53 |
| 3555 | 4799.24 |
| 3556 | 4605.43 |
| 3557 | 4487.28 |
| 3558 | 4458.55 |
| 3559 | 4451.5 |
| 3560 | 4538.53 |
| 3561 | 4679.92 |
| 3562 | 5034.93 |
| 3563 | 5419.58 |
| 3564 | 5853.02 |
| 3565 | 6159.19 |
| 3566 | 6049.4 |
| 3567 | 6038.84 |
| 3568 | 6061.99 |
| 3569 | 6098.76 |
| 3570 | 6153.54 |
| 3571 | 6225.17 |
| 3572 | 6324.72 |
| 3573 | 6182.75 |
| 3574 | 6405.59 |
| 3575 | 6433.17 |
| 3576 | 6428 |
| 3577 | 6424.46 |
| 3578 | 6439.96 |
| 3579 | 6466.35 |
| 3580 | 6449.9 |
| 3581 | 6468.18 |
| 3582 | 6432.12 |
| 3583 | 6390.28 |
| 3584 | 6304.76 |
| 3585 | 6224.67 |
| 3586 | 6019.37 |
| 3587 | 5838.15 |
| 3588 | 5704.27 |
| 3589 | 5557.09 |
| 3590 | 5524.14 |
| 3591 | 5603.76 |
| 3592 | 5569.2 |
| 3593 | 5400.99 |
| 3594 | 5242.1 |
| 3595 | 5095.76 |
| 3596 | 4982.52 |
| 3597 | 4914.57 |
| 3598 | 5143.05 |
| 3599 | 5040.71 |
| 3600 | 4842.76 |
| 3601 | 4715.22 |
| 3602 | 5066.3 |
| 3603 | 4884.73 |
| 3604 | 4699.15 |
| 3605 | 4529.32 |
| 3606 | 4476.05 |
| 3607 | 4418.54 |
| 3608 | 4442.8 |
| 3609 | 4470.01 |
| 3610 | 4599.1 |
| 3611 | 4692.66 |
| 3612 | 4850.43 |
| 3613 | 5066.49 |
| 3614 | 5094.96 |
| 3615 | 5245.14 |
| 3616 | 5398.99 |
| 3617 | 5510.06 |
| 3618 | 5564.09 |
| 3619 | 5629.44 |
| 3620 | 5666.28 |
| 3621 | 5714.88 |
| 3622 | 5725.12 |
| 3623 | 5724.78 |
| 3624 | 5735.81 |
| 3625 | 5703.33 |
| 3626 | 5734.52 |
| 3627 | 5750.47 |
| 3628 | 5754.49 |
| 3629 | 5763.15 |
| 3630 | 5813.16 |
| 3631 | 5836.68 |
| 3632 | 5814.03 |
| 3633 | 5785.77 |
| 3634 | 5742.45 |
| 3635 | 5684.79 |
| 3636 | 5582.53 |
| 3637 | 5470.61 |
| 3638 | 5410.13 |
| 3639 | 5568.73 |
| 3640 | 5504.59 |
| 3641 | 5448.73 |
| 3642 | 5328.72 |
| 3643 | 5175.44 |
| 3644 | 5072.54 |
| 3645 | 5002.78 |
| 3646 | 5191.25 |
| 3647 | 4982.21 |
| 3648 | 4789.29 |
| 3649 | 4662.03 |
| 3650 | 4963.16 |
| 3651 | 4775.81 |
| 3652 | 4586.79 |
| 3653 | 4453.81 |
| 3654 | 4374.35 |
| 3655 | 4262.06 |
| 3656 | 4245.88 |
| 3657 | 4258.75 |
| 3658 | 4312.14 |
| 3659 | 4347.76 |
| 3660 | 4421.83 |
| 3661 | 4528.26 |
| 3662 | 4570.15 |
| 3663 | 4705.88 |
| 3664 | 4836.94 |
| 3665 | 4989.17 |
| 3666 | 5119.68 |
| 3667 | 5199.59 |
| 3668 | 5281.99 |
| 3669 | 5319.08 |
| 3670 | 5393.19 |
| 3671 | 5425.94 |
| 3672 | 5413.99 |
| 3673 | 5440.52 |
| 3674 | 5472.29 |
| 3675 | 5499.44 |
| 3676 | 5484.03 |
| 3677 | 5499.39 |
| 3678 | 5595.65 |
| 3679 | 5637.91 |
| 3680 | 5687.14 |
| 3681 | 5716.32 |
| 3682 | 5663.37 |
| 3683 | 5600.24 |
| 3684 | 5498.37 |
| 3685 | 5409.53 |
| 3686 | 5362.07 |
| 3687 | 5468 |
| 3688 | 5483.11 |
| 3689 | 5325.72 |
| 3690 | 5151.36 |
| 3691 | 5005.75 |
| 3692 | 4899.89 |
| 3693 | 4835.76 |
| 3694 | 5060.35 |
| 3695 | 4885.45 |
| 3696 | 4714.2 |
| 3697 | 4607.88 |
| 3698 | 4941.04 |
| 3699 | 4782.79 |
| 3700 | 4602.07 |
| 3701 | 4468.76 |
| 3702 | 4413.98 |
| 3703 | 4435.26 |
| 3704 | 4534.45 |
| 3705 | 4724.02 |
| 3706 | 5105.49 |
| 3707 | 5415.84 |
| 3708 | 5854.17 |
| 3709 | 6147 |
| 3710 | 6122.8 |
| 3711 | 6220.08 |
| 3712 | 6369.27 |
| 3713 | 6489.68 |
| 3714 | 6575.06 |
| 3715 | 6677.31 |
| 3716 | 6779.3 |
| 3717 | 6877.01 |
| 3718 | 6943.1 |
| 3719 | 6999.88 |
| 3720 | 7074 |
| 3721 | 7152.48 |
| 3722 | 7247.53 |
| 3723 | 7282.05 |
| 3724 | 7282.83 |
| 3725 | 7336.44 |
| 3726 | 7399.16 |
| 3727 | 7444.98 |
| 3728 | 7409.13 |
| 3729 | 7273.95 |
| 3730 | 7018.24 |
| 3731 | 6805 |
| 3732 | 6499.26 |
| 3733 | 6299.52 |
| 3734 | 6161.53 |
| 3735 | 6229.92 |
| 3736 | 6063.95 |
| 3737 | 5885.54 |
| 3738 | 5635.31 |
| 3739 | 5394.93 |
| 3740 | 5302.52 |
| 3741 | 5193.17 |
| 3742 | 5451.18 |
| 3743 | 5233.71 |
| 3744 | 5008.6 |
| 3745 | 4896.05 |
| 3746 | 5221.67 |
| 3747 | 5033.08 |
| 3748 | 4781.38 |
| 3749 | 4665.55 |
| 3750 | 4638.01 |
| 3751 | 4655.26 |
| 3752 | 4738.99 |
| 3753 | 4890.23 |
| 3754 | 5251.17 |
| 3755 | 5559.19 |
| 3756 | 5987.6 |
| 3757 | 6232.81 |
| 3758 | 6236.89 |
| 3759 | 6288.21 |
| 3760 | 6474.71 |
| 3761 | 6590.85 |
| 3762 | 6681.54 |
| 3763 | 6820.44 |
| 3764 | 6934.81 |
| 3765 | 7035.39 |
| 3766 | 7112.51 |
| 3767 | 7172.12 |
| 3768 | 7313.67 |
| 3769 | 7399.59 |
| 3770 | 7487.69 |
| 3771 | 7537.54 |
| 3772 | 7554.12 |
| 3773 | 7581.38 |
| 3774 | 7646.79 |
| 3775 | 7718.21 |
| 3776 | 7730.12 |
| 3777 | 7635.84 |
| 3778 | 7359.52 |
| 3779 | 7090.69 |
| 3780 | 6812.67 |
| 3781 | 6618.04 |
| 3782 | 6472.47 |
| 3783 | 6489.11 |
| 3784 | 6326.28 |
| 3785 | 6112.9 |
| 3786 | 5815.29 |
| 3787 | 5559.52 |
| 3788 | 5356.34 |
| 3789 | 5238.62 |
| 3790 | 5540.65 |
| 3791 | 5391.14 |
| 3792 | 5171.31 |
| 3793 | 5057.13 |
| 3794 | 5415.72 |
| 3795 | 5194.05 |
| 3796 | 4958.02 |
| 3797 | 4839.58 |
| 3798 | 4771.73 |
| 3799 | 4735.55 |
| 3800 | 4825.7 |
| 3801 | 5026.66 |
| 3802 | 5420.05 |
| 3803 | 5738.28 |
| 3804 | 6125.8 |
| 3805 | 6439.73 |
| 3806 | 6382.02 |
| 3807 | 6458.01 |
| 3808 | 6642.05 |
| 3809 | 6745.39 |
| 3810 | 6842.11 |
| 3811 | 6968.71 |
| 3812 | 7073.41 |
| 3813 | 7156.77 |
| 3814 | 7292.07 |
| 3815 | 7343.29 |
| 3816 | 7403.67 |
| 3817 | 7485.26 |
| 3818 | 7511.1 |
| 3819 | 7546.99 |
| 3820 | 7534.3 |
| 3821 | 7567.07 |
| 3822 | 7618.74 |
| 3823 | 7600.58 |
| 3824 | 7497.86 |
| 3825 | 7350.03 |
| 3826 | 7024.2 |
| 3827 | 6828.98 |
| 3828 | 6603.61 |
| 3829 | 6444.41 |
| 3830 | 6364.64 |
| 3831 | 6415.91 |
| 3832 | 6313.5 |
| 3833 | 6122.21 |
| 3834 | 5828.95 |
| 3835 | 5544.76 |
| 3836 | 5369.3 |
| 3837 | 5272.49 |
| 3838 | 5552.26 |
| 3839 | 5390.81 |
| 3840 | 5138.37 |
| 3841 | 5006.34 |
| 3842 | 5361.28 |
| 3843 | 5155.95 |
| 3844 | 4911.81 |
| 3845 | 4784.26 |
| 3846 | 4742.08 |
| 3847 | 4730.43 |
| 3848 | 4823.14 |
| 3849 | 4936.46 |
| 3850 | 5285.48 |
| 3851 | 5665.99 |
| 3852 | 6108.62 |
| 3853 | 6445.55 |
| 3854 | 6403.6 |
| 3855 | 6482.98 |
| 3856 | 6614.69 |
| 3857 | 6761.6 |
| 3858 | 6889.27 |
| 3859 | 6955.59 |
| 3860 | 7113.25 |
| 3861 | 7310.76 |
| 3862 | 7397.63 |
| 3863 | 7456.2 |
| 3864 | 7522.69 |
| 3865 | 7645.62 |
| 3866 | 7715.09 |
| 3867 | 7767.41 |
| 3868 | 7799.13 |
| 3869 | 7854.86 |
| 3870 | 7939.57 |
| 3871 | 7987.1 |
| 3872 | 7929.76 |
| 3873 | 7800.78 |
| 3874 | 7533.57 |
| 3875 | 7288.03 |
| 3876 | 7014.7 |
| 3877 | 6780.98 |
| 3878 | 6667.84 |
| 3879 | 6737.79 |
| 3880 | 6529.24 |
| 3881 | 6237.25 |
| 3882 | 5928.65 |
| 3883 | 5656.55 |
| 3884 | 5474.5 |
| 3885 | 5342.1 |
| 3886 | 5633.14 |
| 3887 | 5445.95 |
| 3888 | 5230.51 |
| 3889 | 5104.96 |
| 3890 | 5419.78 |
| 3891 | 5181.08 |
| 3892 | 4938.46 |
| 3893 | 4832.1 |
| 3894 | 4788.12 |
| 3895 | 4799.55 |
| 3896 | 4890.93 |
| 3897 | 5020.58 |
| 3898 | 5421.02 |
| 3899 | 5756.64 |
| 3900 | 6210.89 |
| 3901 | 6503.29 |
| 3902 | 6502.76 |
| 3903 | 6512.8 |
| 3904 | 6580.02 |
| 3905 | 6614.39 |
| 3906 | 6639.46 |
| 3907 | 6702.91 |
| 3908 | 6733.67 |
| 3909 | 6844.21 |
| 3910 | 6800.42 |
| 3911 | 6770.06 |
| 3912 | 6739.28 |
| 3913 | 6792.3 |
| 3914 | 6834.42 |
| 3915 | 6627.51 |
| 3916 | 6775.23 |
| 3917 | 6758.76 |
| 3918 | 6748.37 |
| 3919 | 6710.16 |
| 3920 | 6667.24 |
| 3921 | 6519.64 |
| 3922 | 6343.65 |
| 3923 | 6179.6 |
| 3924 | 6030.69 |
| 3925 | 5943.64 |
| 3926 | 5898.09 |
| 3927 | 6011.86 |
| 3928 | 5841.57 |
| 3929 | 5736.91 |
| 3930 | 5588.13 |
| 3931 | 5412.13 |
| 3932 | 5292.1 |
| 3933 | 5189.59 |
| 3934 | 5485.55 |
| 3935 | 5337.03 |
| 3936 | 5098.82 |
| 3937 | 4925.57 |
| 3938 | 5233.06 |
| 3939 | 4994.77 |
| 3940 | 4746.74 |
| 3941 | 4648.41 |
| 3942 | 4564.35 |
| 3943 | 4534.34 |
| 3944 | 4599.65 |
| 3945 | 4644.61 |
| 3946 | 4789.92 |
| 3947 | 4870.18 |
| 3948 | 5038.18 |
| 3949 | 5256.8 |
| 3950 | 5337.65 |
| 3951 | 5497.16 |
| 3952 | 5589.16 |
| 3953 | 5602.12 |
| 3954 | 5643 |
| 3955 | 5730.7 |
| 3956 | 5733.03 |
| 3957 | 5745.46 |
| 3958 | 5731.46 |
| 3959 | 5671.11 |
| 3960 | 5655.89 |
| 3961 | 5647.82 |
| 3962 | 5626.83 |
| 3963 | 5638.33 |
| 3964 | 5617.36 |
| 3965 | 5639.91 |
| 3966 | 5654.6 |
| 3967 | 5665.34 |
| 3968 | 5681.43 |
| 3969 | 5671.31 |
| 3970 | 5640.1 |
| 3971 | 5552 |
| 3972 | 5467.2 |
| 3973 | 5411.17 |
| 3974 | 5434.09 |
| 3975 | 5584.83 |
| 3976 | 5525.93 |
| 3977 | 5448.55 |
| 3978 | 5324.43 |
| 3979 | 5195.83 |
| 3980 | 5106.64 |
| 3981 | 5032.02 |
| 3982 | 5275.13 |
| 3983 | 5148.57 |
| 3984 | 4905.63 |
| 3985 | 4738.38 |
| 3986 | 5085.87 |
| 3987 | 4880.08 |
| 3988 | 4664.39 |
| 3989 | 4512.82 |
| 3990 | 4433.7 |
| 3991 | 4367.41 |
| 3992 | 4378.07 |
| 3993 | 4362.3 |
| 3994 | 4469.3 |
| 3995 | 4540 |
| 3996 | 4713.3 |
| 3997 | 4821.57 |
| 3998 | 4905.25 |
| 3999 | 5001.7 |
| 4000 | 5133.65 |
| 4001 | 5265.73 |
| 4002 | 5393.14 |
| 4003 | 5466.74 |
| 4004 | 5508.1 |
| 4005 | 5566.6 |
| 4006 | 5594.32 |
| 4007 | 5635.29 |
| 4008 | 5670.12 |
| 4009 | 5694.11 |
| 4010 | 5668.47 |
| 4011 | 5666.57 |
| 4012 | 5720.19 |
| 4013 | 5772.23 |
| 4014 | 5856.47 |
| 4015 | 5945.5 |
| 4016 | 5959.44 |
| 4017 | 6006.63 |
| 4018 | 5946.85 |
| 4019 | 5892.85 |
| 4020 | 5781.59 |
| 4021 | 5680.34 |
| 4022 | 5728.18 |
| 4023 | 5834.37 |
| 4024 | 5756.21 |
| 4025 | 5586.18 |
| 4026 | 5398.58 |
| 4027 | 5206.02 |
| 4028 | 5139.66 |
| 4029 | 5071.98 |
| 4030 | 5284.89 |
| 4031 | 5159.29 |
| 4032 | 4981.32 |
| 4033 | 4881.81 |
| 4034 | 5250.78 |
| 4035 | 5113.25 |
| 4036 | 4905.56 |
| 4037 | 4777.32 |
| 4038 | 4730.68 |
| 4039 | 4705.82 |
| 4040 | 4839.61 |
| 4041 | 5015.14 |
| 4042 | 5360.04 |
| 4043 | 5694.23 |
| 4044 | 6071.67 |
| 4045 | 6350.87 |
| 4046 | 6292.77 |
| 4047 | 6376.38 |
| 4048 | 6568.73 |
| 4049 | 6729.07 |
| 4050 | 6843.06 |
| 4051 | 6967.36 |
| 4052 | 7049.05 |
| 4053 | 7166.4 |
| 4054 | 7226.42 |
| 4055 | 7338.57 |
| 4056 | 7460.81 |
| 4057 | 7609.99 |
| 4058 | 7652.37 |
| 4059 | 7762.19 |
| 4060 | 7698.33 |
| 4061 | 7851.84 |
| 4062 | 7987.05 |
| 4063 | 7913.64 |
| 4064 | 7657.13 |
| 4065 | 7329.13 |
| 4066 | 6999.77 |
| 4067 | 6696.68 |
| 4068 | 6407.35 |
| 4069 | 6273.3 |
| 4070 | 6218.2 |
| 4071 | 6283.27 |
| 4072 | 6081.64 |
| 4073 | 5876.1 |
| 4074 | 5611.42 |
| 4075 | 5396.97 |
| 4076 | 5268.27 |
| 4077 | 5166.39 |
| 4078 | 5423.94 |
| 4079 | 5281.67 |
| 4080 | 5085.22 |
| 4081 | 4963.73 |
| 4082 | 5320.62 |
| 4083 | 5155.57 |
| 4084 | 4919.99 |
| 4085 | 4814.82 |
| 4086 | 4741.24 |
| 4087 | 4779.89 |
| 4088 | 4863.83 |
| 4089 | 5005.87 |
| 4090 | 5378.94 |
| 4091 | 5734.5 |
| 4092 | 6095.03 |
| 4093 | 6336.7 |
| 4094 | 6265.3 |
| 4095 | 6280.58 |
| 4096 | 6409.75 |
| 4097 | 6438.68 |
| 4098 | 6449.79 |
| 4099 | 6510.15 |
| 4100 | 6548.67 |
| 4101 | 6602.53 |
| 4102 | 6611.82 |
| 4103 | 6641.86 |
| 4104 | 6666.36 |
| 4105 | 6677.02 |
| 4106 | 6654.97 |
| 4107 | 6625.09 |
| 4108 | 6428.69 |
| 4109 | 6566.92 |
| 4110 | 6589.98 |
| 4111 | 6549.16 |
| 4112 | 6550.01 |
| 4113 | 6414.33 |
| 4114 | 6237.29 |
| 4115 | 6053.17 |
| 4116 | 5865.54 |
| 4117 | 5815.82 |
| 4118 | 5845.89 |
| 4119 | 5987.29 |
| 4120 | 5872.22 |
| 4121 | 5754.54 |
| 4122 | 5526.6 |
| 4123 | 5313.71 |
| 4124 | 5160.09 |
| 4125 | 5088.9 |
| 4126 | 5392.68 |
| 4127 | 5306.07 |
| 4128 | 5119.83 |
| 4129 | 4990.52 |
| 4130 | 5383.78 |
| 4131 | 5193.21 |
| 4132 | 5016.97 |
| 4133 | 4853.97 |
| 4134 | 4824.22 |
| 4135 | 4799.44 |
| 4136 | 4892.51 |
| 4137 | 5077.42 |
| 4138 | 5402.56 |
| 4139 | 5760.79 |
| 4140 | 6201.55 |
| 4141 | 6490.56 |
| 4142 | 6392.13 |
| 4143 | 6421.15 |
| 4144 | 6471.02 |
| 4145 | 6495.36 |
| 4146 | 6539.63 |
| 4147 | 6562.55 |
| 4148 | 6608.11 |
| 4149 | 6606.41 |
| 4150 | 6606.07 |
| 4151 | 6590.58 |
| 4152 | 6607.39 |
| 4153 | 6638.12 |
| 4154 | 6665.99 |
| 4155 | 6661.37 |
| 4156 | 6624.69 |
| 4157 | 6619.39 |
| 4158 | 6612.76 |
| 4159 | 6623.72 |
| 4160 | 6574.49 |
| 4161 | 6481.4 |
| 4162 | 6307.39 |
| 4163 | 6168.04 |
| 4164 | 6057.79 |
| 4165 | 5965.84 |
| 4166 | 5995.52 |
| 4167 | 6057.27 |
| 4168 | 5952.36 |
| 4169 | 5808.34 |
| 4170 | 5570.44 |
| 4171 | 5328.26 |
| 4172 | 5219.67 |
| 4173 | 5113.85 |
| 4174 | 5431.4 |
| 4175 | 5327.49 |
| 4176 | 5134.29 |
| 4177 | 5027.46 |
| 4178 | 5376.05 |
| 4179 | 5191.39 |
| 4180 | 4965.72 |
| 4181 | 4813.47 |
| 4182 | 4751.55 |
| 4183 | 4753.24 |
| 4184 | 4864.65 |
| 4185 | 4962.06 |
| 4186 | 5335.77 |
| 4187 | 5723.22 |
| 4188 | 6122.66 |
| 4189 | 6416.27 |
| 4190 | 6309.33 |
| 4191 | 6337 |
| 4192 | 6458.92 |
| 4193 | 6514.15 |
| 4194 | 6584.53 |
| 4195 | 6678.04 |
| 4196 | 6743.18 |
| 4197 | 6838.8 |
| 4198 | 6880.66 |
| 4199 | 6933.67 |
| 4200 | 6997.99 |
| 4201 | 7098.99 |
| 4202 | 7198.32 |
| 4203 | 7269.52 |
| 4204 | 7259.98 |
| 4205 | 7294.23 |
| 4206 | 7386.11 |
| 4207 | 7416.01 |
| 4208 | 7400.28 |
| 4209 | 7339.88 |
| 4210 | 7134.76 |
| 4211 | 6952.53 |
| 4212 | 6740.77 |
| 4213 | 6575.87 |
| 4214 | 6568.96 |
| 4215 | 6584.13 |
| 4216 | 6357.19 |
| 4217 | 6105.64 |
| 4218 | 5867.02 |
| 4219 | 5618.85 |
| 4220 | 5455.44 |
| 4221 | 5357.37 |
| 4222 | 5645.61 |
| 4223 | 5451.22 |
| 4224 | 5209.02 |
| 4225 | 5092.48 |
| 4226 | 5459.93 |
| 4227 | 5245.13 |
| 4228 | 5036.91 |
| 4229 | 4878.7 |
| 4230 | 4846.35 |
| 4231 | 4834.73 |
| 4232 | 4916.35 |
| 4233 | 5097.96 |
| 4234 | 5487.54 |
| 4235 | 5803.91 |
| 4236 | 6203.82 |
| 4237 | 6430.17 |
| 4238 | 6388.19 |
| 4239 | 6447.28 |
| 4240 | 6600.11 |
| 4241 | 6696.6 |
| 4242 | 6805.24 |
| 4243 | 6963.75 |
| 4244 | 7126.04 |
| 4245 | 7223.69 |
| 4246 | 7331.02 |
| 4247 | 7377.77 |
| 4248 | 7399.72 |
| 4249 | 7432.45 |
| 4250 | 7569.9 |
| 4251 | 7693.52 |
| 4252 | 7835.4 |
| 4253 | 7877.85 |
| 4254 | 7926.14 |
| 4255 | 7923.84 |
| 4256 | 7803.16 |
| 4257 | 7685.22 |
| 4258 | 7545.89 |
| 4259 | 7351.17 |
| 4260 | 7100.21 |
| 4261 | 6951.69 |
| 4262 | 6889.28 |
| 4263 | 6903.3 |
| 4264 | 6692.3 |
| 4265 | 6453.73 |
| 4266 | 6127.58 |
| 4267 | 5823.3 |
| 4268 | 5607.18 |
| 4269 | 5480.63 |
| 4270 | 5704.1 |
| 4271 | 5474.87 |
| 4272 | 5217.27 |
| 4273 | 5060.06 |
| 4274 | 5367.09 |
| 4275 | 5123.65 |
| 4276 | 4865.01 |
| 4277 | 4703.09 |
| 4278 | 4619.93 |
| 4279 | 4586.61 |
| 4280 | 4594.86 |
| 4281 | 4679.31 |
| 4282 | 4831.8 |
| 4283 | 4955.91 |
| 4284 | 5073.7 |
| 4285 | 5216.75 |
| 4286 | 5306.07 |
| 4287 | 5390.38 |
| 4288 | 5462.78 |
| 4289 | 5532.91 |
| 4290 | 5575.23 |
| 4291 | 5611.34 |
| 4292 | 5625.82 |
| 4293 | 5673.05 |
| 4294 | 5679.23 |
| 4295 | 5677.97 |
| 4296 | 5680.4 |
| 4297 | 5657.19 |
| 4298 | 5636.58 |
| 4299 | 5634.68 |
| 4300 | 5622.6 |
| 4301 | 5628.06 |
| 4302 | 5661.03 |
| 4303 | 5698.27 |
| 4304 | 5696.49 |
| 4305 | 5659.31 |
| 4306 | 5616.02 |
| 4307 | 5538.59 |
| 4308 | 5487.69 |
| 4309 | 5481.37 |
| 4310 | 5522.93 |
| 4311 | 5592.02 |
| 4312 | 5505.38 |
| 4313 | 5426.55 |
| 4314 | 5303.2 |
| 4315 | 5179.48 |
| 4316 | 5090.12 |
| 4317 | 5014.18 |
| 4318 | 5215.16 |
| 4319 | 5066.61 |
| 4320 | 4879.92 |
| 4321 | 4756.02 |
| 4322 | 5087.72 |
| 4323 | 4894.75 |
| 4324 | 4672.85 |
| 4325 | 4474.75 |
| 4326 | 4398.75 |
| 4327 | 4349.86 |
| 4328 | 4338.57 |
| 4329 | 4366.72 |
| 4330 | 4473.89 |
| 4331 | 4521.6 |
| 4332 | 4551.03 |
| 4333 | 4679.64 |
| 4334 | 4773.93 |
| 4335 | 4889.83 |
| 4336 | 5011.69 |
| 4337 | 5123.84 |
| 4338 | 5230 |
| 4339 | 5262.06 |
| 4340 | 5294.41 |
| 4341 | 5339.1 |
| 4342 | 5362.33 |
| 4343 | 5368.14 |
| 4344 | 5354.8 |
| 4345 | 5318.12 |
| 4346 | 5321.2 |
| 4347 | 5319.08 |
| 4348 | 5296.13 |
| 4349 | 5327.51 |
| 4350 | 5364.99 |
| 4351 | 5427.93 |
| 4352 | 5447.34 |
| 4353 | 5472.97 |
| 4354 | 5507.04 |
| 4355 | 5463.41 |
| 4356 | 5405.96 |
| 4357 | 5388.89 |
| 4358 | 5500.13 |
| 4359 | 5590.51 |
| 4360 | 5484.83 |
| 4361 | 5361.31 |
| 4362 | 5179.55 |
| 4363 | 5008.76 |
| 4364 | 4828.44 |
| 4365 | 4790.37 |
| 4366 | 5069.02 |
| 4367 | 4967.47 |
| 4368 | 4809.47 |
| 4369 | 4716.28 |
| 4370 | 5096.35 |
| 4371 | 4946.13 |
| 4372 | 4755.8 |
| 4373 | 4602.6 |
| 4374 | 4538.15 |
| 4375 | 4539.96 |
| 4376 | 4661.17 |
| 4377 | 4861.36 |
| 4378 | 5216.13 |
| 4379 | 5583.39 |
| 4380 | 6055.14 |
| 4381 | 6333.92 |
| 4382 | 6280.25 |
| 4383 | 6305.87 |
| 4384 | 6377.99 |
| 4385 | 6407.51 |
| 4386 | 6415.82 |
| 4387 | 6504.03 |
| 4388 | 6547.44 |
| 4389 | 6614.54 |
| 4390 | 6639.39 |
| 4391 | 6688.25 |
| 4392 | 6726.6 |
| 4393 | 6786.22 |
| 4394 | 6805.73 |
| 4395 | 6830.72 |
| 4396 | 6794.3 |
| 4397 | 6860.13 |
| 4398 | 6901.12 |
| 4399 | 6905.44 |
| 4400 | 6872.58 |
| 4401 | 6767.01 |
| 4402 | 6560.63 |
| 4403 | 6405.17 |
| 4404 | 6235.79 |
| 4405 | 6169.85 |
| 4406 | 6219.47 |
| 4407 | 6224.22 |
| 4408 | 6048.05 |
| 4409 | 5895.64 |
| 4410 | 5686.09 |
| 4411 | 5440.01 |
| 4412 | 5253.3 |
| 4413 | 5102.14 |
| 4414 | 5400.4 |
| 4415 | 5284.12 |
| 4416 | 5062.87 |
| 4417 | 4955.3 |
| 4418 | 5316.54 |
| 4419 | 5154.52 |
| 4420 | 4938.58 |
| 4421 | 4828.89 |
| 4422 | 4793.7 |
| 4423 | 4810.39 |
| 4424 | 4919.33 |
| 4425 | 5056.79 |
| 4426 | 5479.97 |
| 4427 | 5880.02 |
| 4428 | 6274.64 |
| 4429 | 6505.54 |
| 4430 | 6446.24 |
| 4431 | 6482.97 |
| 4432 | 6565.63 |
| 4433 | 6579.7 |
| 4434 | 6625.96 |
| 4435 | 6692.77 |
| 4436 | 6743.84 |
| 4437 | 6810.91 |
| 4438 | 6872.24 |
| 4439 | 6907.08 |
| 4440 | 6931.04 |
| 4441 | 7008.99 |
| 4442 | 7037.31 |
| 4443 | 7039.26 |
| 4444 | 7077.35 |
| 4445 | 7143.3 |
| 4446 | 7197.17 |
| 4447 | 7240.61 |
| 4448 | 7287.62 |
| 4449 | 7213.47 |
| 4450 | 6992.64 |
| 4451 | 6836.42 |
| 4452 | 6701.5 |
| 4453 | 6615.49 |
| 4454 | 6527.55 |
| 4455 | 6266.12 |
| 4456 | 5920.82 |
| 4457 | 5716.24 |
| 4458 | 5472.66 |
| 4459 | 5269.41 |
| 4460 | 5092.16 |
| 4461 | 4990.62 |
| 4462 | 5276.38 |
| 4463 | 5187.32 |
| 4464 | 4999.17 |
| 4465 | 4875.58 |
| 4466 | 5217.19 |
| 4467 | 5059.93 |
| 4468 | 4842.91 |
| 4469 | 4697.44 |
| 4470 | 4659.51 |
| 4471 | 4631.98 |
| 4472 | 4737.76 |
| 4473 | 4928.83 |
| 4474 | 5254.27 |
| 4475 | 5578.13 |
| 4476 | 6001.69 |
| 4477 | 6288.41 |
| 4478 | 6167.33 |
| 4479 | 6154.69 |
| 4480 | 6241.3 |
| 4481 | 6259.9 |
| 4482 | 6287.01 |
| 4483 | 6225.33 |
| 4484 | 6206.94 |
| 4485 | 6210.78 |
| 4486 | 6328.33 |
| 4487 | 6323.86 |
| 4488 | 6312.38 |
| 4489 | 6334.46 |
| 4490 | 6272.56 |
| 4491 | 6149.55 |
| 4492 | 6130.22 |
| 4493 | 6200.24 |
| 4494 | 6217.18 |
| 4495 | 6225.97 |
| 4496 | 6236.46 |
| 4497 | 6236.52 |
| 4498 | 6124.44 |
| 4499 | 6022.93 |
| 4500 | 5919.15 |
| 4501 | 5909.57 |
| 4502 | 5939.65 |
| 4503 | 5884.11 |
| 4504 | 5725.4 |
| 4505 | 5565.01 |
| 4506 | 5340.37 |
| 4507 | 5096.37 |
| 4508 | 4931.16 |
| 4509 | 4823.29 |
| 4510 | 5141.6 |
| 4511 | 5127.15 |
| 4512 | 4953.88 |
| 4513 | 4826.59 |
| 4514 | 5173.87 |
| 4515 | 5013.84 |
| 4516 | 4810.98 |
| 4517 | 4693.39 |
| 4518 | 4647.72 |
| 4519 | 4650.56 |
| 4520 | 4772.11 |
| 4521 | 4919.15 |
| 4522 | 5290.21 |
| 4523 | 5655.74 |
| 4524 | 6174.33 |
| 4525 | 6497.8 |
| 4526 | 6434.59 |
| 4527 | 6419.03 |
| 4528 | 6485.38 |
| 4529 | 6488.52 |
| 4530 | 6483.37 |
| 4531 | 6506.8 |
| 4532 | 6487.5 |
| 4533 | 6494.47 |
| 4534 | 6464.14 |
| 4535 | 6469.34 |
| 4536 | 6444.21 |
| 4537 | 6449.72 |
| 4538 | 6441.76 |
| 4539 | 6372.24 |
| 4540 | 6280.52 |
| 4541 | 6271.55 |
| 4542 | 6274.26 |
| 4543 | 6280.14 |
| 4544 | 6273.42 |
| 4545 | 6198.03 |
| 4546 | 6203.77 |
| 4547 | 6105.8 |
| 4548 | 6046.69 |
| 4549 | 6069.14 |
| 4550 | 6160.5 |
| 4551 | 6128.95 |
| 4552 | 5943.78 |
| 4553 | 5714.85 |
| 4554 | 5482.56 |
| 4555 | 5236.66 |
| 4556 | 5058.71 |
| 4557 | 4960.32 |
| 4558 | 5239.87 |
| 4559 | 5121.96 |
| 4560 | 4963.29 |
| 4561 | 4892.6 |
| 4562 | 5280.86 |
| 4563 | 5122.14 |
| 4564 | 4927.7 |
| 4565 | 4764.01 |
| 4566 | 4705.05 |
| 4567 | 4698.39 |
| 4568 | 4793.02 |
| 4569 | 4951.49 |
| 4570 | 5248 |
| 4571 | 5591.96 |
| 4572 | 6063.67 |
| 4573 | 6478.87 |
| 4574 | 6398.03 |
| 4575 | 6374.05 |
| 4576 | 6437.9 |
| 4577 | 6434.35 |
| 4578 | 6398.98 |
| 4579 | 6407.4 |
| 4580 | 6427.98 |
| 4581 | 6354.79 |
| 4582 | 6447.3 |
| 4583 | 6373.16 |
| 4584 | 6350.96 |
| 4585 | 6332.57 |
| 4586 | 6310.25 |
| 4587 | 6257.08 |
| 4588 | 6221.79 |
| 4589 | 6157.31 |
| 4590 | 6143.77 |
| 4591 | 6148.94 |
| 4592 | 6082.52 |
| 4593 | 6045.97 |
| 4594 | 5901.4 |
| 4595 | 5774.51 |
| 4596 | 5669.8 |
| 4597 | 5655.99 |
| 4598 | 5795.03 |
| 4599 | 5844.48 |
| 4600 | 5696.47 |
| 4601 | 5541.01 |
| 4602 | 5382.09 |
| 4603 | 5195.39 |
| 4604 | 5089.25 |
| 4605 | 5053.11 |
| 4606 | 5310.71 |
| 4607 | 5187.86 |
| 4608 | 5002.44 |
| 4609 | 4893.82 |
| 4610 | 5230.39 |
| 4611 | 5058.47 |
| 4612 | 4827.46 |
| 4613 | 4668.24 |
| 4614 | 4581.62 |
| 4615 | 4508.91 |
| 4616 | 4519.24 |
| 4617 | 4561.86 |
| 4618 | 4680.29 |
| 4619 | 4789.02 |
| 4620 | 4872.77 |
| 4621 | 5063.96 |
| 4622 | 5158.83 |
| 4623 | 5217.51 |
| 4624 | 5324.18 |
| 4625 | 5375.75 |
| 4626 | 5411.86 |
| 4627 | 5424.83 |
| 4628 | 5449.66 |
| 4629 | 5450.35 |
| 4630 | 5430.14 |
| 4631 | 5421.54 |
| 4632 | 5371.96 |
| 4633 | 5325.86 |
| 4634 | 5301.7 |
| 4635 | 5286.1 |
| 4636 | 5246.9 |
| 4637 | 5249.92 |
| 4638 | 5262 |
| 4639 | 5317.03 |
| 4640 | 5330.34 |
| 4641 | 5323.67 |
| 4642 | 5298.96 |
| 4643 | 5247.85 |
| 4644 | 5187.99 |
| 4645 | 5206.71 |
| 4646 | 5315.24 |
| 4647 | 5352.66 |
| 4648 | 5268.85 |
| 4649 | 5231.7 |
| 4650 | 5144.75 |
| 4651 | 5025.89 |
| 4652 | 4953 |
| 4653 | 4891.29 |
| 4654 | 5114.74 |
| 4655 | 5007.32 |
| 4656 | 4849.94 |
| 4657 | 4730.4 |
| 4658 | 5057.67 |
| 4659 | 4908.58 |
| 4660 | 4688.38 |
| 4661 | 4543.27 |
| 4662 | 4441.58 |
| 4663 | 4372.25 |
| 4664 | 4347.68 |
| 4665 | 4354.74 |
| 4666 | 4405.86 |
| 4667 | 4456.31 |
| 4668 | 4537.72 |
| 4669 | 4622.62 |
| 4670 | 4707.7 |
| 4671 | 4862.74 |
| 4672 | 4992.16 |
| 4673 | 5096.91 |
| 4674 | 5172.81 |
| 4675 | 5185.72 |
| 4676 | 5209.74 |
| 4677 | 5239.06 |
| 4678 | 5243.13 |
| 4679 | 5196.37 |
| 4680 | 5146.04 |
| 4681 | 5118.59 |
| 4682 | 5098.86 |
| 4683 | 5073.74 |
| 4684 | 5056.05 |
| 4685 | 5098 |
| 4686 | 5125.7 |
| 4687 | 5164.08 |
| 4688 | 5170.69 |
| 4689 | 5203.06 |
| 4690 | 5200.34 |
| 4691 | 5135.99 |
| 4692 | 5000.13 |
| 4693 | 5119.17 |
| 4694 | 5264.66 |
| 4695 | 5307.94 |
| 4696 | 5226.31 |
| 4697 | 5127.83 |
| 4698 | 5013.91 |
| 4699 | 4873.34 |
| 4700 | 4773.33 |
| 4701 | 4735 |
| 4702 | 4982.06 |
| 4703 | 4880.75 |
| 4704 | 4703.94 |
| 4705 | 4591.37 |
| 4706 | 4932.09 |
| 4707 | 4775.63 |
| 4708 | 4587.53 |
| 4709 | 4460.08 |
| 4710 | 4353.26 |
| 4711 | 4318.23 |
| 4712 | 4323.98 |
| 4713 | 4366.64 |
| 4714 | 4510.08 |
| 4715 | 4608.2 |
| 4716 | 4702.41 |
| 4717 | 4785.01 |
| 4718 | 4804.03 |
| 4719 | 4890.51 |
| 4720 | 4994.15 |
| 4721 | 5076.33 |
| 4722 | 5142.39 |
| 4723 | 5172.78 |
| 4724 | 5213.27 |
| 4725 | 5237.47 |
| 4726 | 5266.84 |
| 4727 | 5268.38 |
| 4728 | 5275.45 |
| 4729 | 5280.98 |
| 4730 | 5288.05 |
| 4731 | 5292.59 |
| 4732 | 5322.12 |
| 4733 | 5368.44 |
| 4734 | 5418.49 |
| 4735 | 5470.84 |
| 4736 | 5533.34 |
| 4737 | 5569.16 |
| 4738 | 5466.9 |
| 4739 | 5391.42 |
| 4740 | 5314.23 |
| 4741 | 5337.01 |
| 4742 | 5460.81 |
| 4743 | 5459.27 |
| 4744 | 5334.15 |
| 4745 | 5188.2 |
| 4746 | 5009.25 |
| 4747 | 4829.31 |
| 4748 | 4695.13 |
| 4749 | 4631.68 |
| 4750 | 4965.28 |
| 4751 | 4931.95 |
| 4752 | 4796.04 |
| 4753 | 4680.59 |
| 4754 | 5072.93 |
| 4755 | 4910.47 |
| 4756 | 4744.4 |
| 4757 | 4662.49 |
| 4758 | 4619.99 |
| 4759 | 4558.31 |
| 4760 | 4624.1 |
| 4761 | 4768.58 |
| 4762 | 5137.05 |
| 4763 | 5537.96 |
| 4764 | 5992.66 |
| 4765 | 6273.01 |
| 4766 | 6183.27 |
| 4767 | 6188.6 |
| 4768 | 6293.42 |
| 4769 | 6343.08 |
| 4770 | 6388.95 |
| 4771 | 6331.44 |
| 4772 | 6325.86 |
| 4773 | 6413.94 |
| 4774 | 6539.71 |
| 4775 | 6595.97 |
| 4776 | 6657.58 |
| 4777 | 6620.49 |
| 4778 | 6670.74 |
| 4779 | 6694.01 |
| 4780 | 6765.9 |
| 4781 | 6768.71 |
| 4782 | 6783.01 |
| 4783 | 6810.02 |
| 4784 | 6776.41 |
| 4785 | 6657.16 |
| 4786 | 6427.38 |
| 4787 | 6271.19 |
| 4788 | 6107.82 |
| 4789 | 6081.55 |
| 4790 | 6176.57 |
| 4791 | 6095.95 |
| 4792 | 5911.3 |
| 4793 | 5754.73 |
| 4794 | 5562.1 |
| 4795 | 5324.98 |
| 4796 | 5173.45 |
| 4797 | 5106.51 |
| 4798 | 5433.75 |
| 4799 | 5304.65 |
| 4800 | 5127.71 |
| 4801 | 4985.84 |
| 4802 | 5387.27 |
| 4803 | 5231.88 |
| 4804 | 5022.89 |
| 4805 | 4885.57 |
| 4806 | 4826.49 |
| 4807 | 4838.48 |
| 4808 | 4943.29 |
| 4809 | 5075.09 |
| 4810 | 5434.85 |
| 4811 | 5780.28 |
| 4812 | 6191.12 |
| 4813 | 6474.8 |
| 4814 | 6384.14 |
| 4815 | 6421.38 |
| 4816 | 6535.17 |
| 4817 | 6562.96 |
| 4818 | 6621.89 |
| 4819 | 6683.41 |
| 4820 | 6797.53 |
| 4821 | 6917.19 |
| 4822 | 6989.62 |
| 4823 | 7059.88 |
| 4824 | 7138.36 |
| 4825 | 7206.68 |
| 4826 | 7243.08 |
| 4827 | 7288.6 |
| 4828 | 7229.15 |
| 4829 | 7217.58 |
| 4830 | 7194.5 |
| 4831 | 7170.1 |
| 4832 | 7126.43 |
| 4833 | 6969.66 |
| 4834 | 6745.78 |
| 4835 | 6524.87 |
| 4836 | 6344.95 |
| 4837 | 6326.54 |
| 4838 | 6434.93 |
| 4839 | 6392.97 |
| 4840 | 6227.82 |
| 4841 | 6028 |
| 4842 | 5669.96 |
| 4843 | 5522.19 |
| 4844 | 5314.2 |
| 4845 | 5169.73 |
| 4846 | 5428.85 |
| 4847 | 5325.66 |
| 4848 | 5069.26 |
| 4849 | 4930.69 |
| 4850 | 5300.92 |
| 4851 | 5152.66 |
| 4852 | 4982.74 |
| 4853 | 4885.07 |
| 4854 | 4822.74 |
| 4855 | 4827.93 |
| 4856 | 4947.32 |
| 4857 | 5146.8 |
| 4858 | 5449.57 |
| 4859 | 5818.63 |
| 4860 | 6381.5 |
| 4861 | 6703.58 |
| 4862 | 6629.62 |
| 4863 | 6699.89 |
| 4864 | 6795.43 |
| 4865 | 6830.6 |
| 4866 | 6854.35 |
| 4867 | 6833.27 |
| 4868 | 6844.66 |
| 4869 | 6864.63 |
| 4870 | 6969.24 |
| 4871 | 7006.63 |
| 4872 | 7016.68 |
| 4873 | 7030.34 |
| 4874 | 7031.53 |
| 4875 | 6985.81 |
| 4876 | 6923.32 |
| 4877 | 6873.42 |
| 4878 | 6853.04 |
| 4879 | 6843.1 |
| 4880 | 6803.25 |
| 4881 | 6737.25 |
| 4882 | 6575.71 |
| 4883 | 6417.2 |
| 4884 | 6258.07 |
| 4885 | 6253.77 |
| 4886 | 6352.97 |
| 4887 | 6223.96 |
| 4888 | 6032.67 |
| 4889 | 5849.74 |
| 4890 | 5623.28 |
| 4891 | 5378.84 |
| 4892 | 5266.21 |
| 4893 | 5177.74 |
| 4894 | 5467.79 |
| 4895 | 5310.26 |
| 4896 | 5078.13 |
| 4897 | 4941.54 |
| 4898 | 5293.96 |
| 4899 | 5124.94 |
| 4900 | 4918.44 |
| 4901 | 4778.88 |
| 4902 | 4718.02 |
| 4903 | 4727.86 |
| 4904 | 4823.31 |
| 4905 | 5017.22 |
| 4906 | 5411.54 |
| 4907 | 5824.33 |
| 4908 | 6249.95 |
| 4909 | 6494.04 |
| 4910 | 6414.5 |
| 4911 | 6430.05 |
| 4912 | 6572.55 |
| 4913 | 6704.61 |
| 4914 | 6797.92 |
| 4915 | 6901.28 |
| 4916 | 6977.15 |
| 4917 | 7120.01 |
| 4918 | 7138.58 |
| 4919 | 7163.92 |
| 4920 | 7190.46 |
| 4921 | 7266.52 |
| 4922 | 7310.78 |
| 4923 | 7298.83 |
| 4924 | 7298.02 |
| 4925 | 7275.93 |
| 4926 | 7309.78 |
| 4927 | 7317.98 |
| 4928 | 7272.07 |
| 4929 | 7167.8 |
| 4930 | 6940.42 |
| 4931 | 6739.36 |
| 4932 | 6496.13 |
| 4933 | 6441.93 |
| 4934 | 6492.9 |
| 4935 | 6372.79 |
| 4936 | 6149.77 |
| 4937 | 5932.48 |
| 4938 | 5708.73 |
| 4939 | 5500.98 |
| 4940 | 5379.07 |
| 4941 | 5271.79 |
| 4942 | 5469.51 |
| 4943 | 5260.69 |
| 4944 | 5028.5 |
| 4945 | 4857.36 |
| 4946 | 5173.56 |
| 4947 | 4963.71 |
| 4948 | 4792.04 |
| 4949 | 4638.03 |
| 4950 | 4521.94 |
| 4951 | 4474.06 |
| 4952 | 4510.3 |
| 4953 | 4563.73 |
| 4954 | 4693.71 |
| 4955 | 4798.12 |
| 4956 | 4974.72 |
| 4957 | 5121.99 |
| 4958 | 5124.59 |
| 4959 | 5271.45 |
| 4960 | 5432.01 |
| 4961 | 5536.28 |
| 4962 | 5632.58 |
| 4963 | 5680.36 |
| 4964 | 5691.15 |
| 4965 | 5731.55 |
| 4966 | 5712.69 |
| 4967 | 5631.69 |
| 4968 | 5569.61 |
| 4969 | 5490.36 |
| 4970 | 5446.64 |
| 4971 | 5402.38 |
| 4972 | 5372.48 |
| 4973 | 5425.43 |
| 4974 | 5424.28 |
| 4975 | 5428.57 |
| 4976 | 5423.44 |
| 4977 | 5397.89 |
| 4978 | 5358.7 |
| 4979 | 5347.89 |
| 4980 | 5365.01 |
| 4981 | 5351.52 |
| 4982 | 5384.43 |
| 4983 | 5310.88 |
| 4984 | 5218.06 |
| 4985 | 5133.72 |
| 4986 | 5064.83 |
| 4987 | 4926.04 |
| 4988 | 4832.82 |
| 4989 | 4780.4 |
| 4990 | 4982.9 |
| 4991 | 4876.87 |
| 4992 | 4689.98 |
| 4993 | 4563.15 |
| 4994 | 4881.02 |
| 4995 | 4701.89 |
| 4996 | 4494.29 |
| 4997 | 4339.82 |
| 4998 | 4226.13 |
| 4999 | 4163.71 |
| 5000 | 4147.93 |
| 5001 | 4180.84 |
| 5002 | 4232.53 |
| 5003 | 4314.54 |
| 5004 | 4395.55 |
| 5005 | 4493.61 |
| 5006 | 4624.95 |
| 5007 | 4756.03 |
| 5008 | 4857.8 |
| 5009 | 4951.11 |
| 5010 | 5034.52 |
| 5011 | 5034.78 |
| 5012 | 5066.82 |
| 5013 | 5062.17 |
| 5014 | 5053.61 |
| 5015 | 5019.28 |
| 5016 | 5007.69 |
| 5017 | 4990.94 |
| 5018 | 4979.19 |
| 5019 | 4969.15 |
| 5020 | 4962.34 |
| 5021 | 4983.32 |
| 5022 | 5045.53 |
| 5023 | 5117.35 |
| 5024 | 5159.24 |
| 5025 | 5235.29 |
| 5026 | 5265.61 |
| 5027 | 5271.18 |
| 5028 | 5270.02 |
| 5029 | 5400.07 |
| 5030 | 5505.75 |
| 5031 | 5442.69 |
| 5032 | 5320.5 |
| 5033 | 5187.2 |
| 5034 | 5004.77 |
| 5035 | 4840.25 |
| 5036 | 4724.53 |
| 5037 | 4659.91 |
| 5038 | 4852.29 |
| 5039 | 4748.87 |
| 5040 | 4603.26 |
| 5041 | 4515.17 |
| 5042 | 4889.52 |
| 5043 | 4765.63 |
| 5044 | 4577.93 |
| 5045 | 4438.06 |
| 5046 | 4391.11 |
| 5047 | 4367.51 |
| 5048 | 4469.98 |
| 5049 | 4622.46 |
| 5050 | 5014.55 |
| 5051 | 5429.32 |
| 5052 | 5931.03 |
| 5053 | 6306.38 |
| 5054 | 6221.05 |
| 5055 | 6226.73 |
| 5056 | 6294.33 |
| 5057 | 6342.55 |
| 5058 | 6357.35 |
| 5059 | 6386.16 |
| 5060 | 6423.03 |
| 5061 | 6418.36 |
| 5062 | 6414.91 |
| 5063 | 6410.11 |
| 5064 | 6393.6 |
| 5065 | 6375.8 |
| 5066 | 6337.59 |
| 5067 | 6316.87 |
| 5068 | 6247.96 |
| 5069 | 6233.41 |
| 5070 | 6279.81 |
| 5071 | 6281.79 |
| 5072 | 6270.43 |
| 5073 | 6205.4 |
| 5074 | 6085.95 |
| 5075 | 5982.74 |
| 5076 | 5937.75 |
| 5077 | 5991.45 |
| 5078 | 6090.78 |
| 5079 | 6010.73 |
| 5080 | 5838.28 |
| 5081 | 5666.76 |
| 5082 | 5442.95 |
| 5083 | 5205.72 |
| 5084 | 5072.1 |
| 5085 | 4984.96 |
| 5086 | 5280.45 |
| 5087 | 5199.11 |
| 5088 | 5022.24 |
| 5089 | 4922.35 |
| 5090 | 5297.43 |
| 5091 | 5155.68 |
| 5092 | 4934.33 |
| 5093 | 4788.62 |
| 5094 | 4727.65 |
| 5095 | 4703.08 |
| 5096 | 4795.03 |
| 5097 | 4972.49 |
| 5098 | 5345.67 |
| 5099 | 5736.09 |
| 5100 | 6211.75 |
| 5101 | 6570.54 |
| 5102 | 6501.33 |
| 5103 | 6475.16 |
| 5104 | 6550.99 |
| 5105 | 6522.3 |
| 5106 | 6509.49 |
| 5107 | 6524.1 |
| 5108 | 6546.77 |
| 5109 | 6577.65 |
| 5110 | 6556.41 |
| 5111 | 6519.92 |
| 5112 | 6504.15 |
| 5113 | 6477.92 |
| 5114 | 6284.99 |
| 5115 | 6449.2 |
| 5116 | 6413.15 |
| 5117 | 6367.18 |
| 5118 | 6388.97 |
| 5119 | 6406.93 |
| 5120 | 6351.5 |
| 5121 | 6309.38 |
| 5122 | 6162.86 |
| 5123 | 6004.25 |
| 5124 | 5922.75 |
| 5125 | 6012.88 |
| 5126 | 6151.27 |
| 5127 | 6064.95 |
| 5128 | 5906.73 |
| 5129 | 5761.86 |
| 5130 | 5540.23 |
| 5131 | 5319.66 |
| 5132 | 5176.22 |
| 5133 | 5088.01 |
| 5134 | 5384.77 |
| 5135 | 5262.03 |
| 5136 | 5087.07 |
| 5137 | 4963.83 |
| 5138 | 5344.4 |
| 5139 | 5173.57 |
| 5140 | 4972.5 |
| 5141 | 4818.07 |
| 5142 | 4753.92 |
| 5143 | 4748.82 |
| 5144 | 4836.49 |
| 5145 | 5001.65 |
| 5146 | 5398.59 |
| 5147 | 5787.39 |
| 5148 | 6286.7 |
| 5149 | 6559.95 |
| 5150 | 6431.41 |
| 5151 | 6371.52 |
| 5152 | 6416.72 |
| 5153 | 6414.37 |
| 5154 | 6423.12 |
| 5155 | 6474.54 |
| 5156 | 6516.06 |
| 5157 | 6529.99 |
| 5158 | 6536.46 |
| 5159 | 6558.68 |
| 5160 | 6611.13 |
| 5161 | 6633.92 |
| 5162 | 6670.83 |
| 5163 | 6680.16 |
| 5164 | 6647.59 |
| 5165 | 6675.63 |
| 5166 | 6695.43 |
| 5167 | 6666.09 |
| 5168 | 6600.64 |
| 5169 | 6439.37 |
| 5170 | 6219.93 |
| 5171 | 6099.78 |
| 5172 | 5986.19 |
| 5173 | 6066.43 |
| 5174 | 6105.77 |
| 5175 | 6009.62 |
| 5176 | 5878.58 |
| 5177 | 5712.45 |
| 5178 | 5504.83 |
| 5179 | 5265.96 |
| 5180 | 5094.92 |
| 5181 | 5017.87 |
| 5182 | 5291.04 |
| 5183 | 5156.56 |
| 5184 | 4967.87 |
| 5185 | 4825.05 |
| 5186 | 5223.62 |
| 5187 | 5030.18 |
| 5188 | 4839.02 |
| 5189 | 4706.4 |
| 5190 | 4666.52 |
| 5191 | 4651.07 |
| 5192 | 4751.56 |
| 5193 | 4946.38 |
| 5194 | 5310.56 |
| 5195 | 5728.3 |
| 5196 | 6163.85 |
| 5197 | 6376.2 |
| 5198 | 6266.02 |
| 5199 | 6274.76 |
| 5200 | 6370.09 |
| 5201 | 6408.27 |
| 5202 | 6523.31 |
| 5203 | 6611.69 |
| 5204 | 6706.4 |
| 5205 | 6791.44 |
| 5206 | 6865.88 |
| 5207 | 6891.26 |
| 5208 | 6958.2 |
| 5209 | 7018.22 |
| 5210 | 6893.12 |
| 5211 | 7124.51 |
| 5212 | 7117.77 |
| 5213 | 7121.74 |
| 5214 | 7206.65 |
| 5215 | 7269.93 |
| 5216 | 7245.28 |
| 5217 | 7104.53 |
| 5218 | 6822.3 |
| 5219 | 6597.18 |
| 5220 | 6408.2 |
| 5221 | 6406.68 |
| 5222 | 6447.26 |
| 5223 | 6321.47 |
| 5224 | 6089.46 |
| 5225 | 5892.22 |
| 5226 | 5648.06 |
| 5227 | 5426.56 |
| 5228 | 5303.55 |
| 5229 | 5240.17 |
| 5230 | 5529.54 |
| 5231 | 5353.19 |
| 5232 | 5132.67 |
| 5233 | 4993.77 |
| 5234 | 5421.47 |
| 5235 | 5244.13 |
| 5236 | 5032.52 |
| 5237 | 4889.97 |
| 5238 | 4833.71 |
| 5239 | 4833.79 |
| 5240 | 4919.38 |
| 5241 | 5045.84 |
| 5242 | 5397.08 |
| 5243 | 5743.27 |
| 5244 | 6140.22 |
| 5245 | 6379.72 |
| 5246 | 6247.83 |
| 5247 | 6245.91 |
| 5248 | 6417.06 |
| 5249 | 6488.13 |
| 5250 | 6547.79 |
| 5251 | 6621.04 |
| 5252 | 6688.21 |
| 5253 | 6766.99 |
| 5254 | 6790.79 |
| 5255 | 6845.99 |
| 5256 | 6864.01 |
| 5257 | 6919.71 |
| 5258 | 6935.29 |
| 5259 | 6957.95 |
| 5260 | 6923.96 |
| 5261 | 6882.16 |
| 5262 | 6877.16 |
| 5263 | 6828.81 |
| 5264 | 6753 |
| 5265 | 6647.49 |
| 5266 | 6466.12 |
| 5267 | 6275.35 |
| 5268 | 6068.73 |
| 5269 | 6074.58 |
| 5270 | 6145.45 |
| 5271 | 6001.83 |
| 5272 | 5776.45 |
| 5273 | 5619.66 |
| 5274 | 5417.62 |
| 5275 | 5218.58 |
| 5276 | 5088.37 |
| 5277 | 4983.37 |
| 5278 | 5240.68 |
| 5279 | 5111.04 |
| 5280 | 4886.84 |
| 5281 | 4740.35 |
| 5282 | 5068.63 |
| 5283 | 4901.77 |
| 5284 | 4745.9 |
| 5285 | 4600.53 |
| 5286 | 4512.17 |
| 5287 | 4482.14 |
| 5288 | 4498.61 |
| 5289 | 4558.11 |
| 5290 | 4654.57 |
| 5291 | 4754.03 |
| 5292 | 4853.19 |
| 5293 | 4957.37 |
| 5294 | 5078.83 |
| 5295 | 5268.72 |
| 5296 | 5436.6 |
| 5297 | 5560.46 |
| 5298 | 5694.84 |
| 5299 | 5785.83 |
| 5300 | 5859.36 |
| 5301 | 5948.17 |
| 5302 | 5997.13 |
| 5303 | 6053.37 |
| 5304 | 6091.29 |
| 5305 | 6155.09 |
| 5306 | 6217.78 |
| 5307 | 6330.7 |
| 5308 | 6418.95 |
| 5309 | 6491.36 |
| 5310 | 6512.87 |
| 5311 | 6594.93 |
| 5312 | 6579.17 |
| 5313 | 6617.84 |
| 5314 | 6598.8 |
| 5315 | 6455.07 |
| 5316 | 6297.92 |
| 5317 | 6278.6 |
| 5318 | 6274.41 |
| 5319 | 6142.59 |
| 5320 | 5987.34 |
| 5321 | 5892.8 |
| 5322 | 5731.25 |
| 5323 | 5544.35 |
| 5324 | 5450.76 |
| 5325 | 5336.42 |
| 5326 | 5484.52 |
| 5327 | 5300.19 |
| 5328 | 5085.13 |
| 5329 | 4952.7 |
| 5330 | 5297.67 |
| 5331 | 5073.54 |
| 5332 | 4850.15 |
| 5333 | 4704.69 |
| 5334 | 4594.54 |
| 5335 | 4526.14 |
| 5336 | 4539.21 |
| 5337 | 4578.02 |
| 5338 | 4616.61 |
| 5339 | 4691.2 |
| 5340 | 4775.16 |
| 5341 | 4847.96 |
| 5342 | 4924.01 |
| 5343 | 5047.32 |
| 5344 | 5200.85 |
| 5345 | 5340.76 |
| 5346 | 5490.67 |
| 5347 | 5548.67 |
| 5348 | 5632.71 |
| 5349 | 5675.39 |
| 5350 | 5773.15 |
| 5351 | 5809.69 |
| 5352 | 5802.17 |
| 5353 | 5735.12 |
| 5354 | 5668.3 |
| 5355 | 5625.34 |
| 5356 | 5618.22 |
| 5357 | 5593.72 |
| 5358 | 5622.59 |
| 5359 | 5658.49 |
| 5360 | 5665.51 |
| 5361 | 5686.81 |
| 5362 | 5710.53 |
| 5363 | 5681.9 |
| 5364 | 5662.23 |
| 5365 | 5747.21 |
| 5366 | 5721.95 |
| 5367 | 5600.61 |
| 5368 | 5523.47 |
| 5369 | 5401.36 |
| 5370 | 5233.65 |
| 5371 | 5053.8 |
| 5372 | 4930.98 |
| 5373 | 4847.46 |
| 5374 | 5091.51 |
| 5375 | 5001.29 |
| 5376 | 4851.94 |
| 5377 | 4748.4 |
| 5378 | 5131.96 |
| 5379 | 4984.42 |
| 5380 | 4805.28 |
| 5381 | 4681.49 |
| 5382 | 4600.23 |
| 5383 | 4610.86 |
| 5384 | 4705.48 |
| 5385 | 4865.68 |
| 5386 | 5275.28 |
| 5387 | 5634.16 |
| 5388 | 6126.74 |
| 5389 | 6414.45 |
| 5390 | 6336.44 |
| 5391 | 6342.29 |
| 5392 | 6405.02 |
| 5393 | 6394.97 |
| 5394 | 6435.96 |
| 5395 | 6479.49 |
| 5396 | 6477.74 |
| 5397 | 6501.35 |
| 5398 | 6516.39 |
| 5399 | 6523.07 |
| 5400 | 6531.19 |
| 5401 | 6538.17 |
| 5402 | 6465.54 |
| 5403 | 6398.45 |
| 5404 | 6478.76 |
| 5405 | 6444.24 |
| 5406 | 6486.79 |
| 5407 | 6509.45 |
| 5408 | 6478.5 |
| 5409 | 6408.45 |
| 5410 | 6216.97 |
| 5411 | 6073.61 |
| 5412 | 5966.17 |
| 5413 | 6060.58 |
| 5414 | 6109.33 |
| 5415 | 5960.43 |
| 5416 | 5782.68 |
| 5417 | 5645.51 |
| 5418 | 5426 |
| 5419 | 5218.66 |
| 5420 | 5022.59 |
| 5421 | 4948.03 |
| 5422 | 5259.42 |
| 5423 | 5147.79 |
| 5424 | 4934.75 |
| 5425 | 4805.65 |
| 5426 | 5160.07 |
| 5427 | 4993.75 |
| 5428 | 4764.34 |
| 5429 | 4644.91 |
| 5430 | 4594.3 |
| 5431 | 4588.33 |
| 5432 | 4689.25 |
| 5433 | 4868.91 |
| 5434 | 5237.09 |
| 5435 | 5642.67 |
| 5436 | 6190.21 |
| 5437 | 6485.38 |
| 5438 | 6355.03 |
| 5439 | 6343.16 |
| 5440 | 6433.85 |
| 5441 | 6449.02 |
| 5442 | 6478.49 |
| 5443 | 6514.85 |
| 5444 | 6540.54 |
| 5445 | 6592.43 |
| 5446 | 6648.79 |
| 5447 | 6647.53 |
| 5448 | 6653.92 |
| 5449 | 6620.15 |
| 5450 | 6618.45 |
| 5451 | 6612.55 |
| 5452 | 6537.88 |
| 5453 | 6500.84 |
| 5454 | 6481.46 |
| 5455 | 6476.52 |
| 5456 | 6498.48 |
| 5457 | 6471.38 |
| 5458 | 6341.2 |
| 5459 | 6240.31 |
| 5460 | 6172.81 |
| 5461 | 6255.41 |
| 5462 | 6213.36 |
| 5463 | 6060.67 |
| 5464 | 5891.76 |
| 5465 | 5757.34 |
| 5466 | 5523.67 |
| 5467 | 5282.28 |
| 5468 | 5138.85 |
| 5469 | 5061.02 |
| 5470 | 5341.67 |
| 5471 | 5219.29 |
| 5472 | 5024.11 |
| 5473 | 4915.24 |
| 5474 | 5293.35 |
| 5475 | 5102.13 |
| 5476 | 4929.32 |
| 5477 | 4811.76 |
| 5478 | 4769.05 |
| 5479 | 4778.27 |
| 5480 | 4865.03 |
| 5481 | 5048.65 |
| 5482 | 5398.86 |
| 5483 | 5790.51 |
| 5484 | 6304.74 |
| 5485 | 6627.79 |
| 5486 | 6520.17 |
| 5487 | 6486.24 |
| 5488 | 6537.58 |
| 5489 | 6568.03 |
| 5490 | 6653.29 |
| 5491 | 6681.6 |
| 5492 | 6709.21 |
| 5493 | 6673.92 |
| 5494 | 6763.85 |
| 5495 | 6772.8 |
| 5496 | 6771.35 |
| 5497 | 6764.99 |
| 5498 | 6785.18 |
| 5499 | 6785.72 |
| 5500 | 6791.61 |
| 5501 | 6754.71 |
| 5502 | 6787.16 |
| 5503 | 6749.79 |
| 5504 | 6649.87 |
| 5505 | 6591.78 |
| 5506 | 6412.33 |
| 5507 | 6291.91 |
| 5508 | 6219.02 |
| 5509 | 6289.07 |
| 5510 | 6259.99 |
| 5511 | 6147.4 |
| 5512 | 5998.41 |
| 5513 | 5818.77 |
| 5514 | 5599.72 |
| 5515 | 5392.28 |
| 5516 | 5252.2 |
| 5517 | 5143.52 |
| 5518 | 5409.72 |
| 5519 | 5267.06 |
| 5520 | 5084.97 |
| 5521 | 4953.16 |
| 5522 | 5337.57 |
| 5523 | 5153.87 |
| 5524 | 4906.49 |
| 5525 | 4738.16 |
| 5526 | 4663.92 |
| 5527 | 4640.7 |
| 5528 | 4758.22 |
| 5529 | 4967.41 |
| 5530 | 5333.65 |
| 5531 | 5728.09 |
| 5532 | 6215.17 |
| 5533 | 6500.92 |
| 5534 | 6395.23 |
| 5535 | 6369.11 |
| 5536 | 6420.53 |
| 5537 | 6488.85 |
| 5538 | 6534.8 |
| 5539 | 6569.38 |
| 5540 | 6580.16 |
| 5541 | 6618.26 |
| 5542 | 6590.07 |
| 5543 | 6564.47 |
| 5544 | 6571.29 |
| 5545 | 6570.73 |
| 5546 | 6609.34 |
| 5547 | 6579.81 |
| 5548 | 6497.35 |
| 5549 | 6497.13 |
| 5550 | 6506.38 |
| 5551 | 6499.47 |
| 5552 | 6436.24 |
| 5553 | 6317.52 |
| 5554 | 6130.08 |
| 5555 | 6026.38 |
| 5556 | 5980.95 |
| 5557 | 6157.54 |
| 5558 | 6160.67 |
| 5559 | 6052.16 |
| 5560 | 5882.54 |
| 5561 | 5727.5 |
| 5562 | 5515.03 |
| 5563 | 5292.28 |
| 5564 | 5164.02 |
| 5565 | 5039.35 |
| 5566 | 5339.78 |
| 5567 | 5226.68 |
| 5568 | 5011.7 |
| 5569 | 4894.74 |
| 5570 | 5277.21 |
| 5571 | 5106.94 |
| 5572 | 4857.07 |
| 5573 | 4681.12 |
| 5574 | 4659.68 |
| 5575 | 4639 |
| 5576 | 4764.7 |
| 5577 | 4936.22 |
| 5578 | 5289.7 |
| 5579 | 5715.21 |
| 5580 | 6194.55 |
| 5581 | 6505.69 |
| 5582 | 6382.63 |
| 5583 | 6352.92 |
| 5584 | 6413.43 |
| 5585 | 6400.13 |
| 5586 | 6410.81 |
| 5587 | 6425.03 |
| 5588 | 6354.21 |
| 5589 | 6440.54 |
| 5590 | 6433.91 |
| 5591 | 6420.14 |
| 5592 | 6359.39 |
| 5593 | 6392.51 |
| 5594 | 6380.62 |
| 5595 | 6376.9 |
| 5596 | 6315.91 |
| 5597 | 6273.52 |
| 5598 | 6273.02 |
| 5599 | 6277.22 |
| 5600 | 6209 |
| 5601 | 6147.13 |
| 5602 | 6006.7 |
| 5603 | 5918.2 |
| 5604 | 5893.37 |
| 5605 | 6000.83 |
| 5606 | 6004.06 |
| 5607 | 5906.19 |
| 5608 | 5747.25 |
| 5609 | 5620.97 |
| 5610 | 5480.85 |
| 5611 | 5320.18 |
| 5612 | 5228.13 |
| 5613 | 5158.59 |
| 5614 | 5440.01 |
| 5615 | 5275.28 |
| 5616 | 5066.9 |
| 5617 | 4935.43 |
| 5618 | 5284.67 |
| 5619 | 5112.31 |
| 5620 | 4882.14 |
| 5621 | 4717.21 |
| 5622 | 4612.98 |
| 5623 | 4562.85 |
| 5624 | 4578.81 |
| 5625 | 4654.81 |
| 5626 | 4803.78 |
| 5627 | 4896.26 |
| 5628 | 5091.02 |
| 5629 | 5273.98 |
| 5630 | 5383.28 |
| 5631 | 5518.82 |
| 5632 | 5612.03 |
| 5633 | 5588.16 |
| 5634 | 5608.4 |
| 5635 | 5621.22 |
| 5636 | 5622.23 |
| 5637 | 5598.6 |
| 5638 | 5605.29 |
| 5639 | 5583.99 |
| 5640 | 5549.09 |
| 5641 | 5569.81 |
| 5642 | 5573.22 |
| 5643 | 5556.76 |
| 5644 | 5556.6 |
| 5645 | 5576.95 |
| 5646 | 5585.69 |
| 5647 | 5639.31 |
| 5648 | 5638.84 |
| 5649 | 5625.77 |
| 5650 | 5605.49 |
| 5651 | 5517.79 |
| 5652 | 5476.73 |
| 5653 | 5578.06 |
| 5654 | 5575.92 |
| 5655 | 5410.31 |
| 5656 | 5317.49 |
| 5657 | 5323.03 |
| 5658 | 5207.48 |
| 5659 | 5099.26 |
| 5660 | 5006.15 |
| 5661 | 4952.1 |
| 5662 | 5156.96 |
| 5663 | 5063.39 |
| 5664 | 4882.66 |
| 5665 | 4765.06 |
| 5666 | 5105.2 |
| 5667 | 4942.9 |
| 5668 | 4742.48 |
| 5669 | 4559.06 |
| 5670 | 4445.41 |
| 5671 | 4378.79 |
| 5672 | 4380.01 |
| 5673 | 4403.57 |
| 5674 | 4508.36 |
| 5675 | 4607.72 |
| 5676 | 4695.06 |
| 5677 | 4782.11 |
| 5678 | 4844.35 |
| 5679 | 4905.82 |
| 5680 | 5028.11 |
| 5681 | 5114.8 |
| 5682 | 5185.67 |
| 5683 | 5193.8 |
| 5684 | 5249.74 |
| 5685 | 5301.28 |
| 5686 | 5347.24 |
| 5687 | 5375.71 |
| 5688 | 5346.06 |
| 5689 | 5309.25 |
| 5690 | 5294.58 |
| 5691 | 5312.31 |
| 5692 | 5349.95 |
| 5693 | 5374.8 |
| 5694 | 5412.78 |
| 5695 | 5470.09 |
| 5696 | 5454.7 |
| 5697 | 5461.27 |
| 5698 | 5439.1 |
| 5699 | 5398.11 |
| 5700 | 5402.79 |
| 5701 | 5515.99 |
| 5702 | 5530.35 |
| 5703 | 5436.68 |
| 5704 | 5335.28 |
| 5705 | 5199.18 |
| 5706 | 5090.11 |
| 5707 | 4933.11 |
| 5708 | 4780.45 |
| 5709 | 4701.94 |
| 5710 | 4975.57 |
| 5711 | 4875.24 |
| 5712 | 4741.83 |
| 5713 | 4645.61 |
| 5714 | 5019.83 |
| 5715 | 4861.52 |
| 5716 | 4682.6 |
| 5717 | 4525.27 |
| 5718 | 4472.18 |
| 5719 | 4475.98 |
| 5720 | 4583.4 |
| 5721 | 4766.65 |
| 5722 | 5127.63 |
| 5723 | 5491.01 |
| 5724 | 5982.19 |
| 5725 | 6291.01 |
| 5726 | 6235.25 |
| 5727 | 6229.45 |
| 5728 | 6287.14 |
| 5729 | 6307.61 |
| 5730 | 6095.51 |
| 5731 | 6195.73 |
| 5732 | 6437.14 |
| 5733 | 6486.05 |
| 5734 | 6492.29 |
| 5735 | 6514.04 |
| 5736 | 6553.15 |
| 5737 | 6600.97 |
| 5738 | 6628.15 |
| 5739 | 6683.76 |
| 5740 | 6610.74 |
| 5741 | 6592.4 |
| 5742 | 6614.21 |
| 5743 | 6605.32 |
| 5744 | 6539.67 |
| 5745 | 6457.34 |
| 5746 | 6267.93 |
| 5747 | 6092.16 |
| 5748 | 6006.52 |
| 5749 | 6128.08 |
| 5750 | 6089.8 |
| 5751 | 5912.04 |
| 5752 | 5732.12 |
| 5753 | 5588.07 |
| 5754 | 5382.86 |
| 5755 | 5171.37 |
| 5756 | 5044.27 |
| 5757 | 4996.81 |
| 5758 | 5335.74 |
| 5759 | 5238.46 |
| 5760 | 5046.51 |
| 5761 | 4952.9 |
| 5762 | 5324.38 |
| 5763 | 5157.89 |
| 5764 | 4939.48 |
| 5765 | 4763.92 |
| 5766 | 4677.64 |
| 5767 | 4675.09 |
| 5768 | 4807.99 |
| 5769 | 4976.32 |
| 5770 | 5342.38 |
| 5771 | 5730.68 |
| 5772 | 6196.01 |
| 5773 | 6475.57 |
| 5774 | 6352.17 |
| 5775 | 6326.42 |
| 5776 | 6389.78 |
| 5777 | 6438.16 |
| 5778 | 6478.63 |
| 5779 | 6557.44 |
| 5780 | 6659.17 |
| 5781 | 6754.9 |
| 5782 | 6790.76 |
| 5783 | 6834.26 |
| 5784 | 6899.8 |
| 5785 | 6960.52 |
| 5786 | 7049.19 |
| 5787 | 7095.08 |
| 5788 | 7092.6 |
| 5789 | 7107.15 |
| 5790 | 7132.27 |
| 5791 | 7126.43 |
| 5792 | 7039.88 |
| 5793 | 6923.21 |
| 5794 | 6698.03 |
| 5795 | 6499.2 |
| 5796 | 6390.33 |
| 5797 | 6485.18 |
| 5798 | 6409.73 |
| 5799 | 6227.38 |
| 5800 | 5992.81 |
| 5801 | 5821.42 |
| 5802 | 5597.98 |
| 5803 | 5333.66 |
| 5804 | 5214.54 |
| 5805 | 5138.09 |
| 5806 | 5422.4 |
| 5807 | 5232.96 |